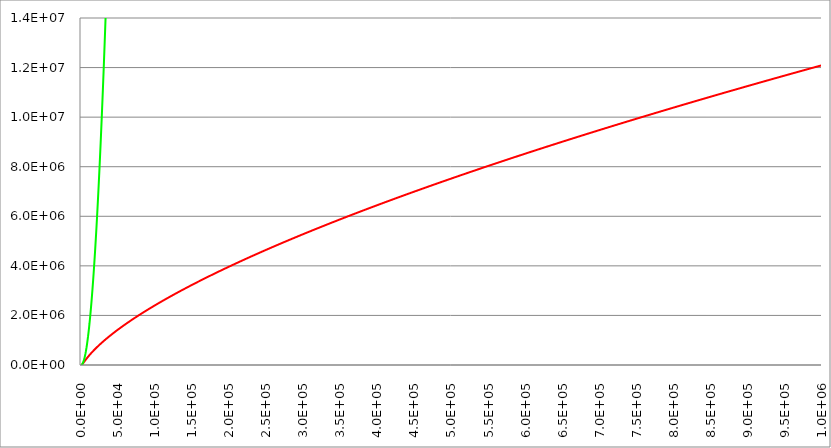
| Category | Series 1 | Series 0 | Series 2 |
|---|---|---|---|
| 0.0 | 0 | 0 |  |
| 500.0 | 3134.597 | 3185.921 |  |
| 1000.0 | 11984.812 | 12743.686 |  |
| 1500.0 | 25248.136 | 28673.293 |  |
| 2000.0 | 41521.552 | 50974.742 |  |
| 2500.0 | 59680.624 | 79648.035 |  |
| 3000.0 | 78943.64 | 114693.17 |  |
| 3500.0 | 98801.646 | 156110.148 |  |
| 4000.0 | 118932.125 | 203898.969 |  |
| 4500.0 | 139132.703 | 258059.633 |  |
| 5000.0 | 159276.982 | 318592.139 |  |
| 5500.0 | 179286.565 | 385496.488 |  |
| 6000.0 | 199113.59 | 458772.68 |  |
| 6500.0 | 218729.787 | 538420.715 |  |
| 7000.0 | 238119.567 | 624440.593 |  |
| 7500.0 | 257275.592 | 716832.313 |  |
| 8000.0 | 276195.912 | 815595.876 |  |
| 8500.0 | 294882.08 | 920731.282 |  |
| 9000.0 | 313337.9 | 1032238.531 |  |
| 9500.0 | 331568.594 | 1150117.622 |  |
| 10000.0 | 349580.239 | 1274368.556 |  |
| 10500.0 | 367379.385 | 1404991.333 |  |
| 11000.0 | 384972.8 | 1541985.953 |  |
| 11500.0 | 402367.29 | 1685352.416 |  |
| 12000.0 | 419569.593 | 1835090.721 |  |
| 12500.0 | 436586.292 | 1991200.869 |  |
| 13000.0 | 453423.774 | 2153682.86 |  |
| 13500.0 | 470088.201 | 2322536.694 |  |
| 14000.0 | 486585.487 | 2497762.37 |  |
| 14500.0 | 502921.298 | 2679359.889 |  |
| 15000.0 | 519101.049 | 2867329.251 |  |
| 15500.0 | 535129.909 | 3061670.456 |  |
| 16000.0 | 551012.807 | 3262383.504 |  |
| 16500.0 | 566754.438 | 3469468.394 |  |
| 17000.0 | 582359.28 | 3682925.127 |  |
| 17500.0 | 597831.594 | 3902753.703 |  |
| 18000.0 | 613175.444 | 4128954.122 |  |
| 18500.0 | 628394.701 | 4361526.384 |  |
| 19000.0 | 643493.056 | 4600470.488 |  |
| 19500.0 | 658474.031 | 4845786.435 |  |
| 20000.0 | 673340.982 | 5097474.225 |  |
| 20500.0 | 688097.118 | 5355533.857 |  |
| 21000.0 | 702745.501 | 5619965.333 |  |
| 21500.0 | 717289.058 | 5890768.651 |  |
| 22000.0 | 731730.587 | 6167943.812 |  |
| 22500.0 | 746072.767 | 6451490.816 |  |
| 23000.0 | 760318.162 | 6741409.662 |  |
| 23500.0 | 774469.227 | 7037700.352 |  |
| 24000.0 | 788528.316 | 7340362.884 |  |
| 24500.0 | 802497.687 | 7649397.259 |  |
| 25000.0 | 816379.506 | 7964803.476 |  |
| 25500.0 | 830175.853 | 8286581.537 |  |
| 26000.0 | 843888.726 | 8614731.44 |  |
| 26500.0 | 857520.047 | 8949253.186 |  |
| 27000.0 | 871071.662 | 9290146.775 |  |
| 27500.0 | 884545.35 | 9637412.206 |  |
| 28000.0 | 897942.822 | 9991049.481 |  |
| 28500.0 | 911265.728 | 10351058.598 |  |
| 29000.0 | 924515.656 | 10717439.558 |  |
| 29500.0 | 937694.139 | 11090192.36 |  |
| 30000.0 | 950802.656 | 11469317.006 |  |
| 30500.0 | 963842.634 | 11854813.494 |  |
| 31000.0 | 976815.451 | 12246681.825 |  |
| 31500.0 | 989722.44 | 12644921.999 |  |
| 32000.0 | 1002564.886 | 13049534.016 |  |
| 32500.0 | 1015344.036 | 13460517.875 |  |
| 33000.0 | 1028061.092 | 13877873.577 |  |
| 33500.0 | 1040717.222 | 14301601.122 |  |
| 34000.0 | 1053313.552 | 14731700.51 |  |
| 34500.0 | 1065851.177 | 15168171.74 |  |
| 35000.0 | 1078331.155 | 15611014.814 |  |
| 35500.0 | 1090754.514 | 16060229.73 |  |
| 36000.0 | 1103122.248 | 16515816.488 |  |
| 36500.0 | 1115435.325 | 16977775.09 |  |
| 37000.0 | 1127694.682 | 17446105.535 |  |
| 37500.0 | 1139901.23 | 17920807.822 |  |
| 38000.0 | 1152055.851 | 18401881.952 |  |
| 38500.0 | 1164159.406 | 18889327.924 |  |
| 39000.0 | 1176212.728 | 19383145.74 |  |
| 39500.0 | 1188216.629 | 19883335.398 |  |
| 40000.0 | 1200171.898 | 20389896.899 |  |
| 40500.0 | 1212079.304 | 20902830.243 |  |
| 41000.0 | 1223939.591 | 21422135.43 |  |
| 41500.0 | 1235753.489 | 21947812.459 |  |
| 42000.0 | 1247521.703 | 22479861.332 |  |
| 42500.0 | 1259244.925 | 23018282.047 |  |
| 43000.0 | 1270923.825 | 23563074.604 |  |
| 43500.0 | 1282559.058 | 24114239.005 |  |
| 44000.0 | 1294151.262 | 24671775.248 |  |
| 44500.0 | 1305701.058 | 25235683.334 |  |
| 45000.0 | 1317209.054 | 25805963.263 |  |
| 45500.0 | 1328675.841 | 26382615.035 |  |
| 46000.0 | 1340101.997 | 26965638.649 |  |
| 46500.0 | 1351488.084 | 27555034.107 |  |
| 47000.0 | 1362834.654 | 28150801.407 |  |
| 47500.0 | 1374142.243 | 28752940.549 |  |
| 48000.0 | 1385411.375 | 29361451.535 |  |
| 48500.0 | 1396642.565 | 29976334.363 |  |
| 49000.0 | 1407836.311 | 30597589.035 |  |
| 49500.0 | 1418993.103 | 31225215.549 |  |
| 50000.0 | 1430113.421 | 31859213.905 |  |
| 50500.0 | 1441197.732 | 32499584.105 |  |
| 51000.0 | 1452246.493 | 33146326.147 |  |
| 51500.0 | 1463260.152 | 33799440.032 |  |
| 52000.0 | 1474239.146 | 34458925.76 |  |
| 52500.0 | 1485183.905 | 35124783.331 |  |
| 53000.0 | 1496094.847 | 35797012.744 |  |
| 53500.0 | 1506972.383 | 36475614 |  |
| 54000.0 | 1517816.915 | 37160587.099 |  |
| 54500.0 | 1528628.836 | 37851932.041 |  |
| 55000.0 | 1539408.532 | 38549648.825 |  |
| 55500.0 | 1550156.381 | 39253737.453 |  |
| 56000.0 | 1560872.752 | 39964197.923 |  |
| 56500.0 | 1571558.008 | 40681030.236 |  |
| 57000.0 | 1582212.506 | 41404234.391 |  |
| 57500.0 | 1592836.592 | 42133810.39 |  |
| 58000.0 | 1603430.609 | 42869758.231 |  |
| 58500.0 | 1613994.892 | 43612077.915 |  |
| 59000.0 | 1624529.769 | 44360769.442 |  |
| 59500.0 | 1635035.563 | 45115832.811 |  |
| 60000.0 | 1645512.59 | 45877268.024 |  |
| 60500.0 | 1655961.16 | 46645075.079 |  |
| 61000.0 | 1666381.578 | 47419253.977 |  |
| 61500.0 | 1676774.142 | 48199804.717 |  |
| 62000.0 | 1687139.147 | 48986727.301 |  |
| 62500.0 | 1697476.879 | 49780021.727 |  |
| 63000.0 | 1707787.623 | 50579687.996 |  |
| 63500.0 | 1718071.655 | 51385726.108 |  |
| 64000.0 | 1728329.25 | 52198136.062 |  |
| 64500.0 | 1738560.674 | 53016917.86 |  |
| 65000.0 | 1748766.191 | 53842071.5 |  |
| 65500.0 | 1758946.06 | 54673596.983 |  |
| 66000.0 | 1769100.535 | 55511494.309 |  |
| 66500.0 | 1779229.867 | 56355763.477 |  |
| 67000.0 | 1789334.301 | 57206404.488 |  |
| 67500.0 | 1799414.078 | 58063417.342 |  |
| 68000.0 | 1809469.436 | 58926802.039 |  |
| 68500.0 | 1819500.609 | 59796558.579 |  |
| 69000.0 | 1829507.826 | 60672686.961 |  |
| 69500.0 | 1839491.314 | 61555187.186 |  |
| 70000.0 | 1849451.294 | 62444059.254 |  |
| 70500.0 | 1859387.985 | 63339303.165 |  |
| 71000.0 | 1869301.602 | 64240918.919 |  |
| 71500.0 | 1879192.357 | 65148906.515 |  |
| 72000.0 | 1889060.459 | 66063265.954 |  |
| 72500.0 | 1898906.112 | 66983997.236 |  |
| 73000.0 | 1908729.518 | 67911100.36 |  |
| 73500.0 | 1918530.875 | 68844575.328 |  |
| 74000.0 | 1928310.381 | 69784422.138 |  |
| 74500.0 | 1938068.226 | 70730640.791 |  |
| 75000.0 | 1947804.601 | 71683231.287 |  |
| 75500.0 | 1957519.693 | 72642193.625 |  |
| 76000.0 | 1967213.685 | 73607527.807 |  |
| 76500.0 | 1976886.758 | 74579233.831 |  |
| 77000.0 | 1986539.093 | 75557311.698 |  |
| 77500.0 | 1996170.863 | 76541761.407 |  |
| 78000.0 | 2005782.243 | 77532582.96 |  |
| 78500.0 | 2015373.403 | 78529776.355 |  |
| 79000.0 | 2024944.511 | 79533341.593 |  |
| 79500.0 | 2034495.734 | 80543278.674 |  |
| 80000.0 | 2044027.235 | 81559587.597 |  |
| 80500.0 | 2053539.175 | 82582268.364 |  |
| 81000.0 | 2063031.713 | 83611320.973 |  |
| 81500.0 | 2072505.006 | 84646745.425 |  |
| 82000.0 | 2081959.208 | 85688541.72 |  |
| 82500.0 | 2091394.471 | 86736709.857 |  |
| 83000.0 | 2100810.946 | 87791249.837 |  |
| 83500.0 | 2110208.781 | 88852161.66 |  |
| 84000.0 | 2119588.122 | 89919445.326 |  |
| 84500.0 | 2128949.112 | 90993100.835 |  |
| 85000.0 | 2138291.895 | 92073128.186 |  |
| 85500.0 | 2147616.611 | 93159527.38 |  |
| 86000.0 | 2156923.397 | 94252298.417 |  |
| 86500.0 | 2166212.39 | 95351441.297 |  |
| 87000.0 | 2175483.726 | 96456956.02 |  |
| 87500.0 | 2184737.537 | 97568842.585 |  |
| 88000.0 | 2193973.954 | 98687100.993 |  |
| 88500.0 | 2203193.107 | 99811731.244 |  |
| 89000.0 | 2212395.124 | 100942733.337 |  |
| 89500.0 | 2221580.131 | 102080107.274 |  |
| 90000.0 | 2230748.253 | 103223853.053 |  |
| 90500.0 | 2239899.612 | 104373970.675 |  |
| 91000.0 | 2249034.331 | 105530460.14 |  |
| 91500.0 | 2258152.529 | 106693321.447 |  |
| 92000.0 | 2267254.324 | 107862554.598 |  |
| 92500.0 | 2276339.833 | 109038159.591 |  |
| 93000.0 | 2285409.173 | 110220136.427 |  |
| 93500.0 | 2294462.457 | 111408485.105 |  |
| 94000.0 | 2303499.798 | 112603205.627 |  |
| 94500.0 | 2312521.306 | 113804297.991 |  |
| 95000.0 | 2321527.093 | 115011762.198 |  |
| 95500.0 | 2330517.267 | 116225598.248 |  |
| 96000.0 | 2339491.935 | 117445806.14 |  |
| 96500.0 | 2348451.203 | 118672385.876 |  |
| 97000.0 | 2357395.176 | 119905337.454 |  |
| 97500.0 | 2366323.958 | 121144660.875 |  |
| 98000.0 | 2375237.65 | 122390356.138 |  |
| 98500.0 | 2384136.355 | 123642423.245 |  |
| 99000.0 | 2393020.172 | 124900862.194 |  |
| 99500.0 | 2401889.2 | 126165672.986 |  |
| 100000.0 | 2410743.536 | 127436855.621 |  |
| 100500.0 | 2419583.278 | 128714410.099 |  |
| 101000.0 | 2428408.52 | 129998336.419 |  |
| 101500.0 | 2437219.357 | 131288634.582 |  |
| 102000.0 | 2446015.882 | 132585304.588 |  |
| 102500.0 | 2454798.188 | 133888346.437 |  |
| 103000.0 | 2463566.365 | 135197760.128 |  |
| 103500.0 | 2472320.505 | 136513545.663 |  |
| 104000.0 | 2481060.695 | 137835703.04 |  |
| 104500.0 | 2489787.025 | 139164232.26 |  |
| 105000.0 | 2498499.582 | 140499133.322 |  |
| 105500.0 | 2507198.451 | 141840406.228 |  |
| 106000.0 | 2515883.719 | 143188050.976 |  |
| 106500.0 | 2524555.47 | 144542067.567 |  |
| 107000.0 | 2533213.786 | 145902456 |  |
| 107500.0 | 2541858.752 | 147269216.277 |  |
| 108000.0 | 2550490.448 | 148642348.396 |  |
| 108500.0 | 2559108.956 | 150021852.358 |  |
| 109000.0 | 2567714.355 | 151407728.163 |  |
| 109500.0 | 2576306.725 | 152799975.811 |  |
| 110000.0 | 2584886.144 | 154198595.301 |  |
| 110500.0 | 2593452.689 | 155603586.635 |  |
| 111000.0 | 2602006.438 | 157014949.811 |  |
| 111500.0 | 2610547.465 | 158432684.829 |  |
| 112000.0 | 2619075.847 | 159856791.691 |  |
| 112500.0 | 2627591.658 | 161287270.395 |  |
| 113000.0 | 2636094.971 | 162724120.942 |  |
| 113500.0 | 2644585.859 | 164167343.332 |  |
| 114000.0 | 2653064.394 | 165616937.565 |  |
| 114500.0 | 2661530.648 | 167072903.641 |  |
| 115000.0 | 2669984.691 | 168535241.559 |  |
| 115500.0 | 2678426.593 | 170003951.32 |  |
| 116000.0 | 2686856.424 | 171479032.924 |  |
| 116500.0 | 2695274.252 | 172960486.37 |  |
| 117000.0 | 2703680.145 | 174448311.66 |  |
| 117500.0 | 2712074.17 | 175942508.792 |  |
| 118000.0 | 2720456.394 | 177443077.767 |  |
| 118500.0 | 2728826.882 | 178950018.584 |  |
| 119000.0 | 2737185.701 | 180463331.245 |  |
| 119500.0 | 2745532.914 | 181983015.748 |  |
| 120000.0 | 2753868.586 | 183509072.094 |  |
| 120500.0 | 2762192.78 | 185041500.283 |  |
| 121000.0 | 2770505.559 | 186580300.315 |  |
| 121500.0 | 2778806.985 | 188125472.189 |  |
| 122000.0 | 2787097.12 | 189677015.906 |  |
| 122500.0 | 2795376.025 | 191234931.466 |  |
| 123000.0 | 2803643.76 | 192799218.869 |  |
| 123500.0 | 2811900.385 | 194369878.115 |  |
| 124000.0 | 2820145.96 | 195946909.203 |  |
| 124500.0 | 2828380.543 | 197530312.134 |  |
| 125000.0 | 2836604.192 | 199120086.908 |  |
| 125500.0 | 2844816.966 | 200716233.524 |  |
| 126000.0 | 2853018.921 | 202318751.984 |  |
| 126500.0 | 2861210.114 | 203927642.286 |  |
| 127000.0 | 2869390.602 | 205542904.431 |  |
| 127500.0 | 2877560.439 | 207164538.419 |  |
| 128000.0 | 2885719.681 | 208792544.249 |  |
| 128500.0 | 2893868.383 | 210426921.923 |  |
| 129000.0 | 2902006.599 | 212067671.439 |  |
| 129500.0 | 2910134.382 | 213714792.798 |  |
| 130000.0 | 2918251.785 | 215368286 |  |
| 130500.0 | 2926358.862 | 217028151.044 |  |
| 131000.0 | 2934455.664 | 218694387.931 |  |
| 131500.0 | 2942542.244 | 220366996.661 |  |
| 132000.0 | 2950618.652 | 222045977.234 |  |
| 132500.0 | 2958684.94 | 223731329.65 |  |
| 133000.0 | 2966741.158 | 225423053.908 |  |
| 133500.0 | 2974787.355 | 227121150.009 |  |
| 134000.0 | 2982823.583 | 228825617.953 |  |
| 134500.0 | 2990849.888 | 230536457.74 |  |
| 135000.0 | 2998866.321 | 232253669.369 |  |
| 135500.0 | 3006872.93 | 233977252.842 |  |
| 136000.0 | 3014869.763 | 235707208.157 |  |
| 136500.0 | 3022856.866 | 237443535.314 |  |
| 137000.0 | 3030834.287 | 239186234.315 |  |
| 137500.0 | 3038802.074 | 240935305.158 |  |
| 138000.0 | 3046760.271 | 242690747.845 |  |
| 138500.0 | 3054708.925 | 244452562.374 |  |
| 139000.0 | 3062648.082 | 246220748.745 |  |
| 139500.0 | 3070577.787 | 247995306.96 |  |
| 140000.0 | 3078498.084 | 249776237.017 |  |
| 140500.0 | 3086409.018 | 251563538.917 |  |
| 141000.0 | 3094310.632 | 253357212.66 |  |
| 141500.0 | 3102202.971 | 255157258.246 |  |
| 142000.0 | 3110086.078 | 256963675.674 |  |
| 142500.0 | 3117959.996 | 258776464.945 |  |
| 143000.0 | 3125824.767 | 260595626.059 |  |
| 143500.0 | 3133680.434 | 262421159.016 |  |
| 144000.0 | 3141527.039 | 264253063.816 |  |
| 144500.0 | 3149364.623 | 266091340.458 |  |
| 145000.0 | 3157193.227 | 267935988.943 |  |
| 145500.0 | 3165012.893 | 269787009.271 |  |
| 146000.0 | 3172823.661 | 271644401.442 |  |
| 146500.0 | 3180625.572 | 273508165.455 |  |
| 147000.0 | 3188418.664 | 275378301.311 |  |
| 147500.0 | 3196202.979 | 277254809.01 |  |
| 148000.0 | 3203978.555 | 279137688.552 |  |
| 148500.0 | 3211745.431 | 281026939.937 |  |
| 149000.0 | 3219503.647 | 282922563.164 |  |
| 149500.0 | 3227253.24 | 284824558.234 |  |
| 150000.0 | 3234994.248 | 286732925.147 |  |
| 150500.0 | 3242726.711 | 288647663.903 |  |
| 151000.0 | 3250450.664 | 290568774.501 |  |
| 151500.0 | 3258166.146 | 292496256.943 |  |
| 152000.0 | 3265873.193 | 294430111.227 |  |
| 152500.0 | 3273571.842 | 296370337.354 |  |
| 153000.0 | 3281262.129 | 298316935.323 |  |
| 153500.0 | 3288944.092 | 300269905.136 |  |
| 154000.0 | 3296617.764 | 302229246.791 |  |
| 154500.0 | 3304283.183 | 304194960.289 |  |
| 155000.0 | 3311940.383 | 306167045.629 |  |
| 155500.0 | 3319589.4 | 308145502.813 |  |
| 156000.0 | 3327230.268 | 310130331.839 |  |
| 156500.0 | 3334863.022 | 312121532.708 |  |
| 157000.0 | 3342487.696 | 314119105.42 |  |
| 157500.0 | 3350104.324 | 316123049.975 |  |
| 158000.0 | 3357712.941 | 318133366.372 |  |
| 158500.0 | 3365313.578 | 320150054.612 |  |
| 159000.0 | 3372906.271 | 322173114.695 |  |
| 159500.0 | 3380491.052 | 324202546.621 |  |
| 160000.0 | 3388067.954 | 326238350.39 |  |
| 160500.0 | 3395637.009 | 328280526.001 |  |
| 161000.0 | 3403198.25 | 330329073.455 |  |
| 161500.0 | 3410751.708 | 332383992.752 |  |
| 162000.0 | 3418297.417 | 334445283.892 |  |
| 162500.0 | 3425835.406 | 336512946.874 |  |
| 163000.0 | 3433365.709 | 338586981.699 |  |
| 163500.0 | 3440888.355 | 340667388.367 |  |
| 164000.0 | 3448403.377 | 342754166.878 |  |
| 164500.0 | 3455910.805 | 344847317.232 |  |
| 165000.0 | 3463410.669 | 346946839.428 |  |
| 165500.0 | 3470902.999 | 349052733.467 |  |
| 166000.0 | 3478387.827 | 351164999.349 |  |
| 166500.0 | 3485865.181 | 353283637.074 |  |
| 167000.0 | 3493335.092 | 355408646.641 |  |
| 167500.0 | 3500797.589 | 357540028.052 |  |
| 168000.0 | 3508252.701 | 359677781.305 |  |
| 168500.0 | 3515700.457 | 361821906.401 |  |
| 169000.0 | 3523140.887 | 363972403.339 |  |
| 169500.0 | 3530574.019 | 366129272.121 |  |
| 170000.0 | 3537999.882 | 368292512.745 |  |
| 170500.0 | 3545418.503 | 370462125.212 |  |
| 171000.0 | 3552829.911 | 372638109.521 |  |
| 171500.0 | 3560234.134 | 374820465.674 |  |
| 172000.0 | 3567631.2 | 377009193.669 |  |
| 172500.0 | 3575021.136 | 379204293.507 |  |
| 173000.0 | 3582403.969 | 381405765.188 |  |
| 173500.0 | 3589779.728 | 383613608.712 |  |
| 174000.0 | 3597148.438 | 385827824.078 |  |
| 174500.0 | 3604510.126 | 388048411.287 |  |
| 175000.0 | 3611864.82 | 390275370.339 |  |
| 175500.0 | 3619212.546 | 392508701.234 |  |
| 176000.0 | 3626553.33 | 394748403.972 |  |
| 176500.0 | 3633887.197 | 396994478.552 |  |
| 177000.0 | 3641214.175 | 399246924.975 |  |
| 177500.0 | 3648534.289 | 401505743.241 |  |
| 178000.0 | 3655847.564 | 403770933.35 |  |
| 178500.0 | 3663154.026 | 406042495.301 |  |
| 179000.0 | 3670453.701 | 408320429.095 |  |
| 179500.0 | 3677746.613 | 410604734.732 |  |
| 180000.0 | 3685032.787 | 412895412.212 |  |
| 180500.0 | 3692312.248 | 415192461.535 |  |
| 181000.0 | 3699585.021 | 417495882.7 |  |
| 181500.0 | 3706851.13 | 419805675.708 |  |
| 182000.0 | 3714110.599 | 422121840.559 |  |
| 182500.0 | 3721363.454 | 424444377.253 |  |
| 183000.0 | 3728609.717 | 426773285.789 |  |
| 183500.0 | 3735849.413 | 429108566.168 |  |
| 184000.0 | 3743082.565 | 431450218.39 |  |
| 184500.0 | 3750309.197 | 433798242.455 |  |
| 185000.0 | 3757529.332 | 436152638.363 |  |
| 185500.0 | 3764742.994 | 438513406.113 |  |
| 186000.0 | 3771950.205 | 440880545.706 |  |
| 186500.0 | 3779150.99 | 443254057.142 |  |
| 187000.0 | 3786345.369 | 445633940.421 |  |
| 187500.0 | 3793533.367 | 448020195.543 |  |
| 188000.0 | 3800715.006 | 450412822.507 |  |
| 188500.0 | 3807890.308 | 452811821.314 |  |
| 189000.0 | 3815059.295 | 455217191.964 |  |
| 189500.0 | 3822221.99 | 457628934.456 |  |
| 190000.0 | 3829378.414 | 460047048.792 |  |
| 190500.0 | 3836528.59 | 462471534.97 |  |
| 191000.0 | 3843672.54 | 464902392.991 |  |
| 191500.0 | 3850810.284 | 467339622.855 |  |
| 192000.0 | 3857941.844 | 469783224.561 |  |
| 192500.0 | 3865067.242 | 472233198.111 |  |
| 193000.0 | 3872186.499 | 474689543.503 |  |
| 193500.0 | 3879299.636 | 477152260.738 |  |
| 194000.0 | 3886406.674 | 479621349.815 |  |
| 194500.0 | 3893507.633 | 482096810.736 |  |
| 195000.0 | 3900602.535 | 484578643.499 |  |
| 195500.0 | 3907691.401 | 487066848.105 |  |
| 196000.0 | 3914774.249 | 489561424.554 |  |
| 196500.0 | 3921851.102 | 492062372.845 |  |
| 197000.0 | 3928921.979 | 494569692.98 |  |
| 197500.0 | 3935986.9 | 497083384.957 |  |
| 198000.0 | 3943045.885 | 499603448.777 |  |
| 198500.0 | 3950098.954 | 502129884.439 |  |
| 199000.0 | 3957146.128 | 504662691.945 |  |
| 199500.0 | 3964187.424 | 507201871.293 |  |
| 200000.0 | 3971222.864 | 509747422.484 |  |
| 200500.0 | 3978252.467 | 512299345.518 |  |
| 201000.0 | 3985276.251 | 514857640.394 |  |
| 201500.0 | 3992294.236 | 517422307.114 |  |
| 202000.0 | 3999306.441 | 519993345.676 |  |
| 202500.0 | 4006312.885 | 522570756.081 |  |
| 203000.0 | 4013313.587 | 525154538.329 |  |
| 203500.0 | 4020308.565 | 527744692.419 |  |
| 204000.0 | 4027297.839 | 530341218.352 |  |
| 204500.0 | 4034281.427 | 532944116.128 |  |
| 205000.0 | 4041259.347 | 535553385.747 |  |
| 205500.0 | 4048231.618 | 538169027.209 |  |
| 206000.0 | 4055198.257 | 540791040.513 |  |
| 206500.0 | 4062159.284 | 543419425.66 |  |
| 207000.0 | 4069114.715 | 546054182.65 |  |
| 207500.0 | 4076064.57 | 548695311.483 |  |
| 208000.0 | 4083008.865 | 551342812.159 |  |
| 208500.0 | 4089947.619 | 553996684.677 |  |
| 209000.0 | 4096880.848 | 556656929.038 |  |
| 209500.0 | 4103808.572 | 559323545.242 |  |
| 210000.0 | 4110730.806 | 561996533.289 |  |
| 210500.0 | 4117647.569 | 564675893.178 |  |
| 211000.0 | 4124558.878 | 567361624.91 |  |
| 211500.0 | 4131464.749 | 570053728.485 |  |
| 212000.0 | 4138365.2 | 572752203.903 |  |
| 212500.0 | 4145260.248 | 575457051.164 |  |
| 213000.0 | 4152149.909 | 578168270.267 |  |
| 213500.0 | 4159034.202 | 580885861.213 |  |
| 214000.0 | 4165913.141 | 583609824.002 |  |
| 214500.0 | 4172786.744 | 586340158.634 |  |
| 215000.0 | 4179655.027 | 589076865.108 |  |
| 215500.0 | 4186518.007 | 591819943.425 |  |
| 216000.0 | 4193375.699 | 594569393.585 |  |
| 216500.0 | 4200228.121 | 597325215.588 |  |
| 217000.0 | 4207075.289 | 600087409.434 |  |
| 217500.0 | 4213917.217 | 602855975.122 |  |
| 218000.0 | 4220753.923 | 605630912.653 |  |
| 218500.0 | 4227585.423 | 608412222.027 |  |
| 219000.0 | 4234411.731 | 611199903.244 |  |
| 219500.0 | 4241232.865 | 613993956.303 |  |
| 220000.0 | 4248048.839 | 616794381.206 |  |
| 220500.0 | 4254859.668 | 619601177.951 |  |
| 221000.0 | 4261665.37 | 622414346.539 |  |
| 221500.0 | 4268465.958 | 625233886.969 |  |
| 222000.0 | 4275261.449 | 628059799.243 |  |
| 222500.0 | 4282051.857 | 630892083.359 |  |
| 223000.0 | 4288837.197 | 633730739.318 |  |
| 223500.0 | 4295617.485 | 636575767.119 |  |
| 224000.0 | 4302392.736 | 639427166.764 |  |
| 224500.0 | 4309162.965 | 642284938.251 |  |
| 225000.0 | 4315928.186 | 645149081.581 |  |
| 225500.0 | 4322688.414 | 648019596.754 |  |
| 226000.0 | 4329443.664 | 650896483.77 |  |
| 226500.0 | 4336193.951 | 653779742.628 |  |
| 227000.0 | 4342939.289 | 656669373.329 |  |
| 227500.0 | 4349679.692 | 659565375.873 |  |
| 228000.0 | 4356415.176 | 662467750.26 |  |
| 228500.0 | 4363145.753 | 665376496.49 |  |
| 229000.0 | 4369871.439 | 668291614.562 |  |
| 229500.0 | 4376592.248 | 671213104.477 |  |
| 230000.0 | 4383308.194 | 674140966.235 |  |
| 230500.0 | 4390019.29 | 677075199.836 |  |
| 231000.0 | 4396725.551 | 680015805.279 |  |
| 231500.0 | 4403426.991 | 682962782.565 |  |
| 232000.0 | 4410123.624 | 685916131.695 |  |
| 232500.0 | 4416815.462 | 688875852.666 |  |
| 233000.0 | 4423502.521 | 691841945.481 |  |
| 233500.0 | 4430184.813 | 694814410.138 |  |
| 234000.0 | 4436862.352 | 697793246.638 |  |
| 234500.0 | 4443535.152 | 700778454.981 |  |
| 235000.0 | 4450203.226 | 703770035.167 |  |
| 235500.0 | 4456866.587 | 706767987.195 |  |
| 236000.0 | 4463525.249 | 709772311.067 |  |
| 236500.0 | 4470179.224 | 712783006.781 |  |
| 237000.0 | 4476828.527 | 715800074.338 |  |
| 237500.0 | 4483473.17 | 718823513.737 |  |
| 238000.0 | 4490113.166 | 721853324.98 |  |
| 238500.0 | 4496748.528 | 724889508.065 |  |
| 239000.0 | 4503379.269 | 727932062.993 |  |
| 239500.0 | 4510005.401 | 730980989.763 |  |
| 240000.0 | 4516626.939 | 734036288.377 |  |
| 240500.0 | 4523243.893 | 737097958.833 |  |
| 241000.0 | 4529856.278 | 740166001.132 |  |
| 241500.0 | 4536464.105 | 743240415.274 |  |
| 242000.0 | 4543067.387 | 746321201.259 |  |
| 242500.0 | 4549666.137 | 749408359.086 |  |
| 243000.0 | 4556260.367 | 752501888.756 |  |
| 243500.0 | 4562850.089 | 755601790.269 |  |
| 244000.0 | 4569435.315 | 758708063.625 |  |
| 244500.0 | 4576016.058 | 761820708.824 |  |
| 245000.0 | 4582592.331 | 764939725.865 |  |
| 245500.0 | 4589164.144 | 768065114.749 |  |
| 246000.0 | 4595731.51 | 771196875.476 |  |
| 246500.0 | 4602294.442 | 774335008.046 |  |
| 247000.0 | 4608852.951 | 777479512.458 |  |
| 247500.0 | 4615407.049 | 780630388.713 |  |
| 248000.0 | 4621956.747 | 783787636.811 |  |
| 248500.0 | 4628502.059 | 786951256.752 |  |
| 249000.0 | 4635042.994 | 790121248.536 |  |
| 249500.0 | 4641579.566 | 793297612.162 |  |
| 250000.0 | 4648111.785 | 796480347.631 |  |
| 250500.0 | 4654639.663 | 799669454.943 |  |
| 251000.0 | 4661163.212 | 802864934.098 |  |
| 251500.0 | 4667682.443 | 806066785.095 |  |
| 252000.0 | 4674197.368 | 809275007.936 |  |
| 252500.0 | 4680707.998 | 812489602.619 |  |
| 253000.0 | 4687214.343 | 815710569.145 |  |
| 253500.0 | 4693716.416 | 818937907.513 |  |
| 254000.0 | 4700214.228 | 822171617.724 |  |
| 254500.0 | 4706707.789 | 825411699.779 |  |
| 255000.0 | 4713197.112 | 828658153.676 |  |
| 255500.0 | 4719682.206 | 831910979.415 |  |
| 256000.0 | 4726163.083 | 835170176.998 |  |
| 256500.0 | 4732639.754 | 838435746.423 |  |
| 257000.0 | 4739112.229 | 841707687.691 |  |
| 257500.0 | 4745580.52 | 844986000.802 |  |
| 258000.0 | 4752044.637 | 848270685.756 |  |
| 258500.0 | 4758504.592 | 851561742.552 |  |
| 259000.0 | 4764960.394 | 854859171.191 |  |
| 259500.0 | 4771412.055 | 858162971.673 |  |
| 260000.0 | 4777859.584 | 861473143.998 |  |
| 260500.0 | 4784302.994 | 864789688.166 |  |
| 261000.0 | 4790742.293 | 868112604.176 |  |
| 261500.0 | 4797177.492 | 871441892.029 |  |
| 262000.0 | 4803608.603 | 874777551.725 |  |
| 262500.0 | 4810035.635 | 878119583.264 |  |
| 263000.0 | 4816458.599 | 881467986.645 |  |
| 263500.0 | 4822877.504 | 884822761.869 |  |
| 264000.0 | 4829292.362 | 888183908.936 |  |
| 264500.0 | 4835703.182 | 891551427.846 |  |
| 265000.0 | 4842109.974 | 894925318.599 |  |
| 265500.0 | 4848512.749 | 898305581.194 |  |
| 266000.0 | 4854911.517 | 901692215.632 |  |
| 266500.0 | 4861306.287 | 905085221.913 |  |
| 267000.0 | 4867697.07 | 908484600.037 |  |
| 267500.0 | 4874083.875 | 911890350.003 |  |
| 268000.0 | 4880466.713 | 915302471.812 |  |
| 268500.0 | 4886845.592 | 918720965.464 |  |
| 269000.0 | 4893220.524 | 922145830.959 |  |
| 269500.0 | 4899591.518 | 925577068.297 |  |
| 270000.0 | 4905958.582 | 929014677.477 |  |
| 270500.0 | 4912321.728 | 932458658.5 |  |
| 271000.0 | 4918680.965 | 935909011.366 |  |
| 271500.0 | 4925036.303 | 939365736.075 |  |
| 272000.0 | 4931387.749 | 942828832.626 |  |
| 272500.0 | 4937735.315 | 946298301.021 |  |
| 273000.0 | 4944079.01 | 949774141.258 |  |
| 273500.0 | 4950418.844 | 953256353.338 |  |
| 274000.0 | 4956754.825 | 956744937.26 |  |
| 274500.0 | 4963086.963 | 960239893.026 |  |
| 275000.0 | 4969415.267 | 963741220.634 |  |
| 275500.0 | 4975739.747 | 967248920.085 |  |
| 276000.0 | 4982060.411 | 970762991.379 |  |
| 276500.0 | 4988377.269 | 974283434.515 |  |
| 277000.0 | 4994690.33 | 977810249.494 |  |
| 277500.0 | 5000999.604 | 981343436.317 |  |
| 278000.0 | 5007305.099 | 984882994.981 |  |
| 278500.0 | 5013606.824 | 988428925.489 |  |
| 279000.0 | 5019904.788 | 991981227.839 |  |
| 279500.0 | 5026199 | 995539902.033 |  |
| 280000.0 | 5032489.47 | 999104948.069 |  |
| 280500.0 | 5038776.206 | 1002676365.947 |  |
| 281000.0 | 5045059.216 | 1006254155.669 |  |
| 281500.0 | 5051338.511 | 1009838317.233 |  |
| 282000.0 | 5057614.097 | 1013428850.64 |  |
| 282500.0 | 5063885.985 | 1017025755.89 |  |
| 283000.0 | 5070154.182 | 1020629032.983 |  |
| 283500.0 | 5076418.699 | 1024238681.919 |  |
| 284000.0 | 5082679.542 | 1027854702.697 |  |
| 284500.0 | 5088936.721 | 1031477095.318 |  |
| 285000.0 | 5095190.244 | 1035105859.782 |  |
| 285500.0 | 5101440.121 | 1038740996.088 |  |
| 286000.0 | 5107686.359 | 1042382504.238 |  |
| 286500.0 | 5113928.966 | 1046030384.23 |  |
| 287000.0 | 5120167.951 | 1049684636.065 |  |
| 287500.0 | 5126403.323 | 1053345259.742 |  |
| 288000.0 | 5132635.091 | 1057012255.263 |  |
| 288500.0 | 5138863.261 | 1060685622.626 |  |
| 289000.0 | 5145087.843 | 1064365361.832 |  |
| 289500.0 | 5151308.844 | 1068051472.881 |  |
| 290000.0 | 5157526.274 | 1071743955.773 |  |
| 290500.0 | 5163740.14 | 1075442810.507 |  |
| 291000.0 | 5169950.45 | 1079148037.084 |  |
| 291500.0 | 5176157.212 | 1082859635.504 |  |
| 292000.0 | 5182360.436 | 1086577605.767 |  |
| 292500.0 | 5188560.127 | 1090301947.872 |  |
| 293000.0 | 5194756.296 | 1094032661.821 |  |
| 293500.0 | 5200948.949 | 1097769747.612 |  |
| 294000.0 | 5207138.094 | 1101513205.246 |  |
| 294500.0 | 5213323.74 | 1105263034.722 |  |
| 295000.0 | 5219505.895 | 1109019236.042 |  |
| 295500.0 | 5225684.566 | 1112781809.204 |  |
| 296000.0 | 5231859.76 | 1116550754.209 |  |
| 296500.0 | 5238031.487 | 1120326071.057 |  |
| 297000.0 | 5244199.753 | 1124107759.747 |  |
| 297500.0 | 5250364.567 | 1127895820.281 |  |
| 298000.0 | 5256525.936 | 1131690252.657 |  |
| 298500.0 | 5262683.868 | 1135491056.876 |  |
| 299000.0 | 5268838.37 | 1139298232.937 |  |
| 299500.0 | 5274989.451 | 1143111780.842 |  |
| 300000.0 | 5281137.117 | 1146931700.589 |  |
| 300500.0 | 5287281.376 | 1150757992.179 |  |
| 301000.0 | 5293422.236 | 1154590655.612 |  |
| 301500.0 | 5299559.704 | 1158429690.887 |  |
| 302000.0 | 5305693.788 | 1162275098.006 |  |
| 302500.0 | 5311824.495 | 1166126876.967 |  |
| 303000.0 | 5317951.833 | 1169985027.771 |  |
| 303500.0 | 5324075.808 | 1173849550.418 |  |
| 304000.0 | 5330196.43 | 1177720444.907 |  |
| 304500.0 | 5336313.704 | 1181597711.239 |  |
| 305000.0 | 5342427.638 | 1185481349.414 |  |
| 305500.0 | 5348538.239 | 1189371359.432 |  |
| 306000.0 | 5354645.515 | 1193267741.293 |  |
| 306500.0 | 5360749.472 | 1197170494.996 |  |
| 307000.0 | 5366850.119 | 1201079620.542 |  |
| 307500.0 | 5372947.462 | 1204995117.931 |  |
| 308000.0 | 5379041.507 | 1208916987.163 |  |
| 308500.0 | 5385132.263 | 1212845228.238 |  |
| 309000.0 | 5391219.737 | 1216779841.155 |  |
| 309500.0 | 5397303.935 | 1220720825.915 |  |
| 310000.0 | 5403384.865 | 1224668182.518 |  |
| 310500.0 | 5409462.534 | 1228621910.964 |  |
| 311000.0 | 5415536.948 | 1232582011.252 |  |
| 311500.0 | 5421608.114 | 1236548483.383 |  |
| 312000.0 | 5427676.04 | 1240521327.357 |  |
| 312500.0 | 5433740.733 | 1244500543.174 |  |
| 313000.0 | 5439802.198 | 1248486130.833 |  |
| 313500.0 | 5445860.444 | 1252478090.336 |  |
| 314000.0 | 5451915.476 | 1256476421.681 |  |
| 314500.0 | 5457967.303 | 1260481124.869 |  |
| 315000.0 | 5464015.929 | 1264492199.899 |  |
| 315500.0 | 5470061.363 | 1268509646.773 |  |
| 316000.0 | 5476103.611 | 1272533465.489 |  |
| 316500.0 | 5482142.679 | 1276563656.048 |  |
| 317000.0 | 5488178.575 | 1280600218.45 |  |
| 317500.0 | 5494211.305 | 1284643152.695 |  |
| 318000.0 | 5500240.876 | 1288692458.782 |  |
| 318500.0 | 5506267.293 | 1292748136.712 |  |
| 319000.0 | 5512290.565 | 1296810186.485 |  |
| 319500.0 | 5518310.696 | 1300878608.101 |  |
| 320000.0 | 5524327.695 | 1304953401.559 |  |
| 320500.0 | 5530341.568 | 1309034566.86 |  |
| 321000.0 | 5536352.32 | 1313122104.004 |  |
| 321500.0 | 5542359.958 | 1317216012.991 |  |
| 322000.0 | 5548364.489 | 1321316293.821 |  |
| 322500.0 | 5554365.919 | 1325422946.493 |  |
| 323000.0 | 5560364.256 | 1329535971.008 |  |
| 323500.0 | 5566359.503 | 1333655367.366 |  |
| 324000.0 | 5572351.67 | 1337781135.567 |  |
| 324500.0 | 5578340.76 | 1341913275.611 |  |
| 325000.0 | 5584326.782 | 1346051787.497 |  |
| 325500.0 | 5590309.741 | 1350196671.226 |  |
| 326000.0 | 5596289.644 | 1354347926.798 |  |
| 326500.0 | 5602266.496 | 1358505554.212 |  |
| 327000.0 | 5608240.304 | 1362669553.47 |  |
| 327500.0 | 5614211.074 | 1366839924.57 |  |
| 328000.0 | 5620178.812 | 1371016667.513 |  |
| 328500.0 | 5626143.526 | 1375199782.299 |  |
| 329000.0 | 5632105.218 | 1379389268.927 |  |
| 329500.0 | 5638063.899 | 1383585127.399 |  |
| 330000.0 | 5644019.572 | 1387787357.713 |  |
| 330500.0 | 5649972.243 | 1391995959.87 |  |
| 331000.0 | 5655921.919 | 1396210933.869 |  |
| 331500.0 | 5661868.606 | 1400432279.712 |  |
| 332000.0 | 5667812.31 | 1404659997.397 |  |
| 332500.0 | 5673753.038 | 1408894086.925 |  |
| 333000.0 | 5679690.793 | 1413134548.296 |  |
| 333500.0 | 5685625.583 | 1417381381.509 |  |
| 334000.0 | 5691557.413 | 1421634586.566 |  |
| 334500.0 | 5697486.29 | 1425894163.465 |  |
| 335000.0 | 5703412.22 | 1430160112.207 |  |
| 335500.0 | 5709335.208 | 1434432432.791 |  |
| 336000.0 | 5715255.26 | 1438711125.219 |  |
| 336500.0 | 5721172.381 | 1442996189.489 |  |
| 337000.0 | 5727086.578 | 1447287625.602 |  |
| 337500.0 | 5732997.857 | 1451585433.558 |  |
| 338000.0 | 5738906.223 | 1455889613.357 |  |
| 338500.0 | 5744811.681 | 1460200164.998 |  |
| 339000.0 | 5750714.239 | 1464517088.482 |  |
| 339500.0 | 5756613.899 | 1468840383.809 |  |
| 340000.0 | 5762510.672 | 1473170050.979 |  |
| 340500.0 | 5768404.559 | 1477506089.991 |  |
| 341000.0 | 5774295.567 | 1481848500.847 |  |
| 341500.0 | 5780183.702 | 1486197283.545 |  |
| 342000.0 | 5786068.97 | 1490552438.086 |  |
| 342500.0 | 5791951.376 | 1494913964.469 |  |
| 343000.0 | 5797830.925 | 1499281862.696 |  |
| 343500.0 | 5803707.623 | 1503656132.765 |  |
| 344000.0 | 5809581.476 | 1508036774.677 |  |
| 344500.0 | 5815452.489 | 1512423788.431 |  |
| 345000.0 | 5821320.669 | 1516817174.029 |  |
| 345500.0 | 5827186.018 | 1521216931.469 |  |
| 346000.0 | 5833048.544 | 1525623060.752 |  |
| 346500.0 | 5838908.252 | 1530035561.878 |  |
| 347000.0 | 5844765.147 | 1534454434.847 |  |
| 347500.0 | 5850619.236 | 1538879679.658 |  |
| 348000.0 | 5856470.522 | 1543311296.313 |  |
| 348500.0 | 5862319.013 | 1547749284.81 |  |
| 349000.0 | 5868164.711 | 1552193645.149 |  |
| 349500.0 | 5874007.624 | 1556644377.332 |  |
| 350000.0 | 5879847.756 | 1561101481.357 |  |
| 350500.0 | 5885685.113 | 1565564957.225 |  |
| 351000.0 | 5891519.7 | 1570034804.936 |  |
| 351500.0 | 5897351.522 | 1574511024.49 |  |
| 352000.0 | 5903180.585 | 1578993615.887 |  |
| 352500.0 | 5909006.893 | 1583482579.126 |  |
| 353000.0 | 5914830.452 | 1587977914.208 |  |
| 353500.0 | 5920651.267 | 1592479621.133 |  |
| 354000.0 | 5926469.343 | 1596987699.9 |  |
| 354500.0 | 5932284.686 | 1601502150.511 |  |
| 355000.0 | 5938097.3 | 1606022972.964 |  |
| 355500.0 | 5943907.191 | 1610550167.26 |  |
| 356000.0 | 5949714.364 | 1615083733.398 |  |
| 356500.0 | 5955518.823 | 1619623671.38 |  |
| 357000.0 | 5961320.574 | 1624169981.204 |  |
| 357500.0 | 5967119.622 | 1628722662.871 |  |
| 358000.0 | 5972915.971 | 1633281716.381 |  |
| 358500.0 | 5978709.628 | 1637847141.734 |  |
| 359000.0 | 5984500.597 | 1642418938.929 |  |
| 359500.0 | 5990288.882 | 1646997107.967 |  |
| 360000.0 | 5996074.49 | 1651581648.848 |  |
| 360500.0 | 6001857.423 | 1656172561.572 |  |
| 361000.0 | 6007637.688 | 1660769846.139 |  |
| 361500.0 | 6013415.29 | 1665373502.548 |  |
| 362000.0 | 6019190.235 | 1669983530.8 |  |
| 362500.0 | 6024962.525 | 1674599930.895 |  |
| 363000.0 | 6030732.167 | 1679222702.832 |  |
| 363500.0 | 6036499.165 | 1683851846.613 |  |
| 364000.0 | 6042263.523 | 1688487362.236 |  |
| 364500.0 | 6048025.249 | 1693129249.702 |  |
| 365000.0 | 6053784.343 | 1697777509.011 |  |
| 365500.0 | 6059540.813 | 1702432140.162 |  |
| 366000.0 | 6065294.664 | 1707093143.157 |  |
| 366500.0 | 6071045.9 | 1711760517.994 |  |
| 367000.0 | 6076794.525 | 1716434264.674 |  |
| 367500.0 | 6082540.545 | 1721114383.196 |  |
| 368000.0 | 6088283.963 | 1725800873.562 |  |
| 368500.0 | 6094024.787 | 1730493735.77 |  |
| 369000.0 | 6099763.017 | 1735192969.821 |  |
| 369500.0 | 6105498.662 | 1739898575.715 |  |
| 370000.0 | 6111231.724 | 1744610553.452 |  |
| 370500.0 | 6116962.208 | 1749328903.031 |  |
| 371000.0 | 6122690.12 | 1754053624.453 |  |
| 371500.0 | 6128415.464 | 1758784717.718 |  |
| 372000.0 | 6134138.244 | 1763522182.826 |  |
| 372500.0 | 6139858.464 | 1768266019.776 |  |
| 373000.0 | 6145576.13 | 1773016228.57 |  |
| 373500.0 | 6151291.246 | 1777772809.206 |  |
| 374000.0 | 6157003.816 | 1782535761.684 |  |
| 374500.0 | 6162713.847 | 1787305086.006 |  |
| 375000.0 | 6168421.34 | 1792080782.17 |  |
| 375500.0 | 6174126.302 | 1796862850.178 |  |
| 376000.0 | 6179828.735 | 1801651290.028 |  |
| 376500.0 | 6185528.647 | 1806446101.72 |  |
| 377000.0 | 6191226.04 | 1811247285.256 |  |
| 377500.0 | 6196920.918 | 1816054840.634 |  |
| 378000.0 | 6202613.287 | 1820868767.855 |  |
| 378500.0 | 6208303.151 | 1825689066.919 |  |
| 379000.0 | 6213990.515 | 1830515737.826 |  |
| 379500.0 | 6219675.38 | 1835348780.575 |  |
| 380000.0 | 6225357.756 | 1840188195.167 |  |
| 380500.0 | 6231037.643 | 1845033981.602 |  |
| 381000.0 | 6236715.045 | 1849886139.88 |  |
| 381500.0 | 6242389.97 | 1854744670.001 |  |
| 382000.0 | 6248062.42 | 1859609571.964 |  |
| 382500.0 | 6253732.4 | 1864480845.77 |  |
| 383000.0 | 6259399.913 | 1869358491.419 |  |
| 383500.0 | 6265064.964 | 1874242508.911 |  |
| 384000.0 | 6270727.56 | 1879132898.245 |  |
| 384500.0 | 6276387.699 | 1884029659.422 |  |
| 385000.0 | 6282045.392 | 1888932792.442 |  |
| 385500.0 | 6287700.64 | 1893842297.305 |  |
| 386000.0 | 6293353.446 | 1898758174.011 |  |
| 386500.0 | 6299003.816 | 1903680422.559 |  |
| 387000.0 | 6304651.754 | 1908609042.95 |  |
| 387500.0 | 6310297.264 | 1913544035.184 |  |
| 388000.0 | 6315940.351 | 1918485399.261 |  |
| 388500.0 | 6321581.018 | 1923433135.18 |  |
| 389000.0 | 6327219.269 | 1928387242.943 |  |
| 389500.0 | 6332855.107 | 1933347722.548 |  |
| 390000.0 | 6338488.54 | 1938314573.996 |  |
| 390500.0 | 6344119.57 | 1943287797.286 |  |
| 391000.0 | 6349748.2 | 1948267392.42 |  |
| 391500.0 | 6355374.435 | 1953253359.396 |  |
| 392000.0 | 6360998.281 | 1958245698.215 |  |
| 392500.0 | 6366619.739 | 1963244408.876 |  |
| 393000.0 | 6372238.812 | 1968249491.381 |  |
| 393500.0 | 6377855.508 | 1973260945.728 |  |
| 394000.0 | 6383469.829 | 1978278771.918 |  |
| 394500.0 | 6389081.78 | 1983302969.951 |  |
| 395000.0 | 6394691.364 | 1988333539.827 |  |
| 395500.0 | 6400298.585 | 1993370481.545 |  |
| 396000.0 | 6405903.447 | 1998413795.106 |  |
| 396500.0 | 6411505.955 | 2003463480.51 |  |
| 397000.0 | 6417106.111 | 2008519537.757 |  |
| 397500.0 | 6422703.92 | 2013581966.847 |  |
| 398000.0 | 6428299.388 | 2018650767.779 |  |
| 398500.0 | 6433892.514 | 2023725940.554 |  |
| 399000.0 | 6439483.307 | 2028807485.172 |  |
| 399500.0 | 6445071.768 | 2033895401.633 |  |
| 400000.0 | 6450657.902 | 2038989689.936 |  |
| 400500.0 | 6456241.711 | 2044090350.082 |  |
| 401000.0 | 6461823.201 | 2049197382.071 |  |
| 401500.0 | 6467402.377 | 2054310785.903 |  |
| 402000.0 | 6472979.239 | 2059430561.578 |  |
| 402500.0 | 6478553.792 | 2064556709.095 |  |
| 403000.0 | 6484126.044 | 2069689228.455 |  |
| 403500.0 | 6489695.993 | 2074828119.658 |  |
| 404000.0 | 6495263.644 | 2079973382.704 |  |
| 404500.0 | 6500829.006 | 2085125017.592 |  |
| 405000.0 | 6506392.074 | 2090283024.324 |  |
| 405500.0 | 6511952.859 | 2095447402.898 |  |
| 406000.0 | 6517511.364 | 2100618153.314 |  |
| 406500.0 | 6523067.59 | 2105795275.574 |  |
| 407000.0 | 6528621.541 | 2110978769.676 |  |
| 407500.0 | 6534173.222 | 2116168635.622 |  |
| 408000.0 | 6539722.635 | 2121364873.41 |  |
| 408500.0 | 6545269.785 | 2126567483.04 |  |
| 409000.0 | 6550814.677 | 2131776464.514 |  |
| 409500.0 | 6556357.313 | 2136991817.83 |  |
| 410000.0 | 6561897.696 | 2142213542.989 |  |
| 410500.0 | 6567435.832 | 2147441639.991 |  |
| 411000.0 | 6572971.722 | 2152676108.836 |  |
| 411500.0 | 6578505.371 | 2157916949.523 |  |
| 412000.0 | 6584036.782 | 2163164162.053 |  |
| 412500.0 | 6589565.961 | 2168417746.426 |  |
| 413000.0 | 6595092.908 | 2173677702.642 |  |
| 413500.0 | 6600617.628 | 2178944030.701 |  |
| 414000.0 | 6606140.126 | 2184216730.602 |  |
| 414500.0 | 6611660.405 | 2189495802.346 |  |
| 415000.0 | 6617178.466 | 2194781245.933 |  |
| 415500.0 | 6622694.316 | 2200073061.362 |  |
| 416000.0 | 6628207.956 | 2205371248.635 |  |
| 416500.0 | 6633719.39 | 2210675807.75 |  |
| 417000.0 | 6639228.625 | 2215986738.708 |  |
| 417500.0 | 6644735.66 | 2221304041.509 |  |
| 418000.0 | 6650240.5 | 2226627716.152 |  |
| 418500.0 | 6655743.148 | 2231957762.639 |  |
| 419000.0 | 6661243.609 | 2237294180.968 |  |
| 419500.0 | 6666741.887 | 2242636971.14 |  |
| 420000.0 | 6672237.982 | 2247986133.155 |  |
| 420500.0 | 6677731.901 | 2253341667.012 |  |
| 421000.0 | 6683223.645 | 2258703572.712 |  |
| 421500.0 | 6688713.219 | 2264071850.255 |  |
| 422000.0 | 6694200.625 | 2269446499.641 |  |
| 422500.0 | 6699685.867 | 2274827520.87 |  |
| 423000.0 | 6705168.951 | 2280214913.941 |  |
| 423500.0 | 6710649.875 | 2285608678.855 |  |
| 424000.0 | 6716128.648 | 2291008815.612 |  |
| 424500.0 | 6721605.269 | 2296415324.212 |  |
| 425000.0 | 6727079.745 | 2301828204.654 |  |
| 425500.0 | 6732552.077 | 2307247456.94 |  |
| 426000.0 | 6738022.269 | 2312673081.068 |  |
| 426500.0 | 6743490.323 | 2318105077.039 |  |
| 427000.0 | 6748956.243 | 2323543444.852 |  |
| 427500.0 | 6754420.035 | 2328988184.509 |  |
| 428000.0 | 6759881.701 | 2334439296.008 |  |
| 428500.0 | 6765341.241 | 2339896779.35 |  |
| 429000.0 | 6770798.662 | 2345360634.535 |  |
| 429500.0 | 6776253.967 | 2350830861.562 |  |
| 430000.0 | 6781707.156 | 2356307460.432 |  |
| 430500.0 | 6787158.236 | 2361790431.146 |  |
| 431000.0 | 6792607.209 | 2367279773.701 |  |
| 431500.0 | 6798054.079 | 2372775488.1 |  |
| 432000.0 | 6803498.849 | 2378277574.341 |  |
| 432500.0 | 6808941.519 | 2383786032.426 |  |
| 433000.0 | 6814382.096 | 2389300862.353 |  |
| 433500.0 | 6819820.582 | 2394822064.122 |  |
| 434000.0 | 6825256.98 | 2400349637.735 |  |
| 434500.0 | 6830691.294 | 2405883583.19 |  |
| 435000.0 | 6836123.529 | 2411423900.489 |  |
| 435500.0 | 6841553.682 | 2416970589.629 |  |
| 436000.0 | 6846981.764 | 2422523650.613 |  |
| 436500.0 | 6852407.77 | 2428083083.44 |  |
| 437000.0 | 6857831.712 | 2433648888.109 |  |
| 437500.0 | 6863253.585 | 2439221064.621 |  |
| 438000.0 | 6868673.398 | 2444799612.976 |  |
| 438500.0 | 6874091.148 | 2450384533.173 |  |
| 439000.0 | 6879506.845 | 2455975825.214 |  |
| 439500.0 | 6884920.489 | 2461573489.097 |  |
| 440000.0 | 6890332.083 | 2467177524.823 |  |
| 440500.0 | 6895741.629 | 2472787932.391 |  |
| 441000.0 | 6901149.135 | 2478404711.803 |  |
| 441500.0 | 6906554.596 | 2484027863.057 |  |
| 442000.0 | 6911958.024 | 2489657386.154 |  |
| 442500.0 | 6917359.415 | 2495293281.094 |  |
| 443000.0 | 6922758.773 | 2500935547.877 |  |
| 443500.0 | 6928156.104 | 2506584186.502 |  |
| 444000.0 | 6933551.409 | 2512239196.97 |  |
| 444500.0 | 6938944.695 | 2517900579.281 |  |
| 445000.0 | 6944335.959 | 2523568333.435 |  |
| 445500.0 | 6949725.208 | 2529242459.432 |  |
| 446000.0 | 6955112.444 | 2534922957.271 |  |
| 446500.0 | 6960497.668 | 2540609826.953 |  |
| 447000.0 | 6965880.886 | 2546303068.478 |  |
| 447500.0 | 6971262.099 | 2552002681.845 |  |
| 448000.0 | 6976641.312 | 2557708667.056 |  |
| 448500.0 | 6982018.528 | 2563421024.109 |  |
| 449000.0 | 6987393.748 | 2569139753.005 |  |
| 449500.0 | 6992766.974 | 2574864853.744 |  |
| 450000.0 | 6998138.211 | 2580596326.325 |  |
| 450500.0 | 7003507.461 | 2586334170.75 |  |
| 451000.0 | 7008874.73 | 2592078387.017 |  |
| 451500.0 | 7014240.018 | 2597828975.127 |  |
| 452000.0 | 7019603.327 | 2603585935.079 |  |
| 452500.0 | 7024964.663 | 2609349266.875 |  |
| 453000.0 | 7030324.024 | 2615118970.513 |  |
| 453500.0 | 7035681.419 | 2620895045.994 |  |
| 454000.0 | 7041036.848 | 2626677493.318 |  |
| 454500.0 | 7046390.312 | 2632466312.485 |  |
| 455000.0 | 7051741.817 | 2638261503.494 |  |
| 455500.0 | 7057091.364 | 2644063066.346 |  |
| 456000.0 | 7062438.957 | 2649871001.041 |  |
| 456500.0 | 7067784.598 | 2655685307.579 |  |
| 457000.0 | 7073128.29 | 2661505985.959 |  |
| 457500.0 | 7078470.036 | 2667333036.182 |  |
| 458000.0 | 7083809.841 | 2673166458.248 |  |
| 458500.0 | 7089147.703 | 2679006252.157 |  |
| 459000.0 | 7094483.626 | 2684852417.909 |  |
| 459500.0 | 7099817.615 | 2690704955.503 |  |
| 460000.0 | 7105149.677 | 2696563864.941 |  |
| 460500.0 | 7110479.805 | 2702429146.22 |  |
| 461000.0 | 7115808.009 | 2708300799.343 |  |
| 461500.0 | 7121134.286 | 2714178824.309 |  |
| 462000.0 | 7126458.644 | 2720063221.117 |  |
| 462500.0 | 7131781.086 | 2725953989.768 |  |
| 463000.0 | 7137101.611 | 2731851130.262 |  |
| 463500.0 | 7142420.224 | 2737754642.599 |  |
| 464000.0 | 7147736.927 | 2743664526.778 |  |
| 464500.0 | 7153051.723 | 2749580782.8 |  |
| 465000.0 | 7158364.614 | 2755503410.665 |  |
| 465500.0 | 7163675.605 | 2761432410.373 |  |
| 466000.0 | 7168984.697 | 2767367781.924 |  |
| 466500.0 | 7174291.89 | 2773309525.317 |  |
| 467000.0 | 7179597.194 | 2779257640.553 |  |
| 467500.0 | 7184900.604 | 2785212127.632 |  |
| 468000.0 | 7190202.127 | 2791172986.554 |  |
| 468500.0 | 7195501.766 | 2797140217.318 |  |
| 469000.0 | 7200799.519 | 2803113819.925 |  |
| 469500.0 | 7206095.394 | 2809093794.375 |  |
| 470000.0 | 7211389.392 | 2815080140.668 |  |
| 470500.0 | 7216681.515 | 2821072858.804 |  |
| 471000.0 | 7221971.767 | 2827071948.782 |  |
| 471500.0 | 7227260.149 | 2833077410.603 |  |
| 472000.0 | 7232546.662 | 2839089244.267 |  |
| 472500.0 | 7237831.313 | 2845107449.774 |  |
| 473000.0 | 7243114.101 | 2851132027.123 |  |
| 473500.0 | 7248395.034 | 2857162976.315 |  |
| 474000.0 | 7253674.107 | 2863200297.351 |  |
| 474500.0 | 7258951.327 | 2869243990.228 |  |
| 475000.0 | 7264226.697 | 2875294054.949 |  |
| 475500.0 | 7269500.217 | 2881350491.512 |  |
| 476000.0 | 7274771.893 | 2887413299.919 |  |
| 476500.0 | 7280041.724 | 2893482480.167 |  |
| 477000.0 | 7285309.715 | 2899558032.259 |  |
| 477500.0 | 7290575.866 | 2905639956.194 |  |
| 478000.0 | 7295840.186 | 2911728251.971 |  |
| 478500.0 | 7301102.668 | 2917822919.591 |  |
| 479000.0 | 7306363.322 | 2923923959.054 |  |
| 479500.0 | 7311622.15 | 2930031370.36 |  |
| 480000.0 | 7316879.148 | 2936145153.508 |  |
| 480500.0 | 7322134.325 | 2942265308.499 |  |
| 481000.0 | 7327387.685 | 2948391835.333 |  |
| 481500.0 | 7332639.221 | 2954524734.01 |  |
| 482000.0 | 7337888.947 | 2960664004.529 |  |
| 482500.0 | 7343136.858 | 2966809646.892 |  |
| 483000.0 | 7348382.96 | 2972961661.097 |  |
| 483500.0 | 7353627.25 | 2979120047.145 |  |
| 484000.0 | 7358869.741 | 2985284805.035 |  |
| 484500.0 | 7364110.425 | 2991455934.769 |  |
| 485000.0 | 7369349.311 | 2997633436.345 |  |
| 485500.0 | 7374586.397 | 3003817309.764 |  |
| 486000.0 | 7379821.687 | 3010007555.026 |  |
| 486500.0 | 7385055.185 | 3016204172.131 |  |
| 487000.0 | 7390286.893 | 3022407161.078 |  |
| 487500.0 | 7395516.812 | 3028616521.868 |  |
| 488000.0 | 7400744.947 | 3034832254.501 |  |
| 488500.0 | 7405971.298 | 3041054358.977 |  |
| 489000.0 | 7411195.867 | 3047282835.295 |  |
| 489500.0 | 7416418.662 | 3053517683.456 |  |
| 490000.0 | 7421639.675 | 3059758903.46 |  |
| 490500.0 | 7426858.919 | 3066006495.307 |  |
| 491000.0 | 7432076.391 | 3072260458.997 |  |
| 491500.0 | 7437292.094 | 3078520794.529 |  |
| 492000.0 | 7442506.032 | 3084787501.904 |  |
| 492500.0 | 7447718.2 | 3091060581.122 |  |
| 493000.0 | 7452928.611 | 3097340032.183 |  |
| 493500.0 | 7458137.262 | 3103625855.087 |  |
| 494000.0 | 7463344.161 | 3109918049.833 |  |
| 494500.0 | 7468549.302 | 3116216616.422 |  |
| 495000.0 | 7473752.687 | 3122521554.854 |  |
| 495500.0 | 7478954.328 | 3128832865.128 |  |
| 496000.0 | 7484154.22 | 3135150547.246 |  |
| 496500.0 | 7489352.366 | 3141474601.206 |  |
| 497000.0 | 7494548.769 | 3147805027.009 |  |
| 497500.0 | 7499743.43 | 3154141824.655 |  |
| 498000.0 | 7504936.355 | 3160484994.143 |  |
| 498500.0 | 7510127.546 | 3166834535.475 |  |
| 499000.0 | 7515317.001 | 3173190448.649 |  |
| 499500.0 | 7520504.728 | 3179552733.666 |  |
| 500000.0 | 7525690.724 | 3185921390.525 |  |
| 500500.0 | 7530874.993 | 3192296419.228 |  |
| 501000.0 | 7536057.542 | 3198677819.773 |  |
| 501500.0 | 7541238.364 | 3205065592.161 |  |
| 502000.0 | 7546417.47 | 3211459736.392 |  |
| 502500.0 | 7551594.857 | 3217860252.465 |  |
| 503000.0 | 7556770.53 | 3224267140.382 |  |
| 503500.0 | 7561944.487 | 3230680400.141 |  |
| 504000.0 | 7567116.736 | 3237100031.743 |  |
| 504500.0 | 7572287.277 | 3243526035.187 |  |
| 505000.0 | 7577456.112 | 3249958410.475 |  |
| 505500.0 | 7582623.245 | 3256397157.605 |  |
| 506000.0 | 7587788.675 | 3262842276.578 |  |
| 506500.0 | 7592952.405 | 3269293767.394 |  |
| 507000.0 | 7598114.439 | 3275751630.052 |  |
| 507500.0 | 7603274.777 | 3282215864.554 |  |
| 508000.0 | 7608433.42 | 3288686470.898 |  |
| 508500.0 | 7613590.377 | 3295163449.085 |  |
| 509000.0 | 7618745.644 | 3301646799.115 |  |
| 509500.0 | 7623899.226 | 3308136520.987 |  |
| 510000.0 | 7629051.125 | 3314632614.702 |  |
| 510500.0 | 7634201.344 | 3321135080.26 |  |
| 511000.0 | 7639349.88 | 3327643917.661 |  |
| 511500.0 | 7644496.738 | 3334159126.905 |  |
| 512000.0 | 7649641.926 | 3340680707.991 |  |
| 512500.0 | 7654785.437 | 3347208660.921 |  |
| 513000.0 | 7659927.278 | 3353742985.692 |  |
| 513500.0 | 7665067.451 | 3360283682.307 |  |
| 514000.0 | 7670205.96 | 3366830750.765 |  |
| 514500.0 | 7675342.8 | 3373384191.065 |  |
| 515000.0 | 7680477.98 | 3379944003.208 |  |
| 515500.0 | 7685611.505 | 3386510187.194 |  |
| 516000.0 | 7690743.366 | 3393082743.023 |  |
| 516500.0 | 7695873.574 | 3399661670.694 |  |
| 517000.0 | 7701002.127 | 3406246970.208 |  |
| 517500.0 | 7706129.032 | 3412838641.565 |  |
| 518000.0 | 7711254.284 | 3419436684.765 |  |
| 518500.0 | 7716377.892 | 3426041099.808 |  |
| 519000.0 | 7721499.856 | 3432651886.693 |  |
| 519500.0 | 7726620.174 | 3439269045.421 |  |
| 520000.0 | 7731738.853 | 3445892575.992 |  |
| 520500.0 | 7736855.893 | 3452522478.406 |  |
| 521000.0 | 7741971.297 | 3459158752.662 |  |
| 521500.0 | 7747085.067 | 3465801398.761 |  |
| 522000.0 | 7752197.202 | 3472450416.703 |  |
| 522500.0 | 7757307.713 | 3479105806.488 |  |
| 523000.0 | 7762416.589 | 3485767568.116 |  |
| 523500.0 | 7767523.843 | 3492435701.586 |  |
| 524000.0 | 7772629.47 | 3499110206.899 |  |
| 524500.0 | 7777733.475 | 3505791084.055 |  |
| 525000.0 | 7782835.86 | 3512478333.054 |  |
| 525500.0 | 7787936.631 | 3519171953.896 |  |
| 526000.0 | 7793035.781 | 3525871946.58 |  |
| 526500.0 | 7798133.322 | 3532578311.107 |  |
| 527000.0 | 7803229.248 | 3539291047.477 |  |
| 527500.0 | 7808323.567 | 3546010155.689 |  |
| 528000.0 | 7813416.277 | 3552735635.745 |  |
| 528500.0 | 7818507.383 | 3559467487.643 |  |
| 529000.0 | 7823596.885 | 3566205711.384 |  |
| 529500.0 | 7828684.78 | 3572950306.968 |  |
| 530000.0 | 7833771.079 | 3579701274.394 |  |
| 530500.0 | 7838855.784 | 3586458613.663 |  |
| 531000.0 | 7843938.888 | 3593222324.775 |  |
| 531500.0 | 7849020.402 | 3599992407.73 |  |
| 532000.0 | 7854100.322 | 3606768862.528 |  |
| 532500.0 | 7859178.653 | 3613551689.168 |  |
| 533000.0 | 7864255.399 | 3620340887.652 |  |
| 533500.0 | 7869330.558 | 3627136457.978 |  |
| 534000.0 | 7874404.133 | 3633938400.146 |  |
| 534500.0 | 7879476.124 | 3640746714.158 |  |
| 535000.0 | 7884546.541 | 3647561400.012 |  |
| 535500.0 | 7889615.379 | 3654382457.709 |  |
| 536000.0 | 7894682.637 | 3661209887.249 |  |
| 536500.0 | 7899748.324 | 3668043688.632 |  |
| 537000.0 | 7904812.441 | 3674883861.857 |  |
| 537500.0 | 7909874.983 | 3681730406.926 |  |
| 538000.0 | 7914935.963 | 3688583323.837 |  |
| 538500.0 | 7919995.371 | 3695442612.59 |  |
| 539000.0 | 7925053.219 | 3702308273.187 |  |
| 539500.0 | 7930109.501 | 3709180305.626 |  |
| 540000.0 | 7935164.225 | 3716058709.909 |  |
| 540500.0 | 7940217.396 | 3722943486.033 |  |
| 541000.0 | 7945269.003 | 3729834634.001 |  |
| 541500.0 | 7950319.061 | 3736732153.812 |  |
| 542000.0 | 7955367.563 | 3743636045.465 |  |
| 542500.0 | 7960414.51 | 3750546308.961 |  |
| 543000.0 | 7965459.916 | 3757462944.3 |  |
| 543500.0 | 7970503.776 | 3764385951.481 |  |
| 544000.0 | 7975546.086 | 3771315330.506 |  |
| 544500.0 | 7980586.854 | 3778251081.373 |  |
| 545000.0 | 7985626.084 | 3785193204.083 |  |
| 545500.0 | 7990663.771 | 3792141698.636 |  |
| 546000.0 | 7995699.92 | 3799096565.031 |  |
| 546500.0 | 8000734.536 | 3806057803.27 |  |
| 547000.0 | 8005767.615 | 3813025413.351 |  |
| 547500.0 | 8010799.17 | 3819999395.274 |  |
| 548000.0 | 8015829.188 | 3826979749.041 |  |
| 548500.0 | 8020857.678 | 3833966474.651 |  |
| 549000.0 | 8025884.645 | 3840959572.103 |  |
| 549500.0 | 8030910.087 | 3847959041.398 |  |
| 550000.0 | 8035934.006 | 3854964882.535 |  |
| 550500.0 | 8040956.402 | 3861977095.516 |  |
| 551000.0 | 8045977.285 | 3868995680.339 |  |
| 551500.0 | 8050996.642 | 3876020637.005 |  |
| 552000.0 | 8056014.489 | 3883051965.514 |  |
| 552500.0 | 8061030.827 | 3890089665.866 |  |
| 553000.0 | 8066045.648 | 3897133738.06 |  |
| 553500.0 | 8071058.958 | 3904184182.098 |  |
| 554000.0 | 8076070.763 | 3911240997.978 |  |
| 554500.0 | 8081081.064 | 3918304185.701 |  |
| 555000.0 | 8086089.856 | 3925373745.266 |  |
| 555500.0 | 8091097.149 | 3932449676.674 |  |
| 556000.0 | 8096102.94 | 3939531979.926 |  |
| 556500.0 | 8101107.231 | 3946620655.019 |  |
| 557000.0 | 8106110.026 | 3953715701.956 |  |
| 557500.0 | 8111111.33 | 3960817120.736 |  |
| 558000.0 | 8116111.135 | 3967924911.358 |  |
| 558500.0 | 8121109.45 | 3975039073.823 |  |
| 559000.0 | 8126106.273 | 3982159608.131 |  |
| 559500.0 | 8131101.609 | 3989286514.281 |  |
| 560000.0 | 8136095.462 | 3996419792.275 |  |
| 560500.0 | 8141087.829 | 4003559442.111 |  |
| 561000.0 | 8146078.713 | 4010705463.79 |  |
| 561500.0 | 8151068.113 | 4017857857.312 |  |
| 562000.0 | 8156056.035 | 4025016622.676 |  |
| 562500.0 | 8161042.477 | 4032181759.883 |  |
| 563000.0 | 8166027.45 | 4039353268.933 |  |
| 563500.0 | 8171010.945 | 4046531149.826 |  |
| 564000.0 | 8175992.966 | 4053715402.562 |  |
| 564500.0 | 8180973.519 | 4060906027.14 |  |
| 565000.0 | 8185952.601 | 4068103023.562 |  |
| 565500.0 | 8190930.217 | 4075306391.826 |  |
| 566000.0 | 8195906.366 | 4082516131.932 |  |
| 566500.0 | 8200881.057 | 4089732243.882 |  |
| 567000.0 | 8205854.283 | 4096954727.674 |  |
| 567500.0 | 8210826.048 | 4104183583.309 |  |
| 568000.0 | 8215796.354 | 4111418810.787 |  |
| 568500.0 | 8220765.198 | 4118660410.108 |  |
| 569000.0 | 8225732.597 | 4125908381.271 |  |
| 569500.0 | 8230698.538 | 4133162724.278 |  |
| 570000.0 | 8235663.023 | 4140423439.127 |  |
| 570500.0 | 8240626.065 | 4147690525.818 |  |
| 571000.0 | 8245587.657 | 4154963984.353 |  |
| 571500.0 | 8250547.803 | 4162243814.73 |  |
| 572000.0 | 8255506.497 | 4169530016.95 |  |
| 572500.0 | 8260463.752 | 4176822591.013 |  |
| 573000.0 | 8265419.569 | 4184121536.919 |  |
| 573500.0 | 8270373.939 | 4191426854.667 |  |
| 574000.0 | 8275326.879 | 4198738544.259 |  |
| 574500.0 | 8280278.378 | 4206056605.693 |  |
| 575000.0 | 8285228.443 | 4213381038.97 |  |
| 575500.0 | 8290177.073 | 4220711844.089 |  |
| 576000.0 | 8295124.274 | 4228049021.052 |  |
| 576500.0 | 8300070.039 | 4235392569.857 |  |
| 577000.0 | 8305014.383 | 4242742490.505 |  |
| 577500.0 | 8309957.299 | 4250098782.995 |  |
| 578000.0 | 8314898.789 | 4257461447.329 |  |
| 578500.0 | 8319838.855 | 4264830483.505 |  |
| 579000.0 | 8324777.499 | 4272205891.524 |  |
| 579500.0 | 8329714.721 | 4279587671.386 |  |
| 580000.0 | 8334650.531 | 4286975823.091 |  |
| 580500.0 | 8339584.918 | 4294370346.638 |  |
| 581000.0 | 8344517.888 | 4301771242.028 |  |
| 581500.0 | 8349449.458 | 4309178509.261 |  |
| 582000.0 | 8354379.601 | 4316592148.337 |  |
| 582500.0 | 8359308.339 | 4324012159.256 |  |
| 583000.0 | 8364235.672 | 4331438542.017 |  |
| 583500.0 | 8369161.594 | 4338871296.621 |  |
| 584000.0 | 8374086.11 | 4346310423.068 |  |
| 584500.0 | 8379009.219 | 4353755921.357 |  |
| 585000.0 | 8383930.934 | 4361207791.49 |  |
| 585500.0 | 8388851.238 | 4368666033.465 |  |
| 586000.0 | 8393770.154 | 4376130647.283 |  |
| 586500.0 | 8398687.666 | 4383601632.944 |  |
| 587000.0 | 8403603.782 | 4391078990.447 |  |
| 587500.0 | 8408518.502 | 4398562719.794 |  |
| 588000.0 | 8413431.834 | 4406052820.983 |  |
| 588500.0 | 8418343.774 | 4413549294.015 |  |
| 589000.0 | 8423254.321 | 4421052138.89 |  |
| 589500.0 | 8428163.485 | 4428561355.607 |  |
| 590000.0 | 8433071.259 | 4436076944.167 |  |
| 590500.0 | 8437977.652 | 4443598904.57 |  |
| 591000.0 | 8442882.655 | 4451127236.816 |  |
| 591500.0 | 8447786.279 | 4458661940.905 |  |
| 592000.0 | 8452688.519 | 4466203016.836 |  |
| 592500.0 | 8457589.391 | 4473750464.61 |  |
| 593000.0 | 8462488.873 | 4481304284.227 |  |
| 593500.0 | 8467386.989 | 4488864475.687 |  |
| 594000.0 | 8472283.729 | 4496431038.989 |  |
| 594500.0 | 8477179.094 | 4504003974.135 |  |
| 595000.0 | 8482073.087 | 4511583281.123 |  |
| 595500.0 | 8486965.714 | 4519168959.954 |  |
| 596000.0 | 8491856.976 | 4526761010.627 |  |
| 596500.0 | 8496746.864 | 4534359433.144 |  |
| 597000.0 | 8501635.391 | 4541964227.503 |  |
| 597500.0 | 8506522.551 | 4549575393.705 |  |
| 598000.0 | 8511408.35 | 4557192931.749 |  |
| 598500.0 | 8516292.793 | 4564816841.637 |  |
| 599000.0 | 8521175.874 | 4572447123.367 |  |
| 599500.0 | 8526057.6 | 4580083776.94 |  |
| 600000.0 | 8530937.966 | 4587726802.356 |  |
| 600500.0 | 8535816.982 | 4595376199.615 |  |
| 601000.0 | 8540694.645 | 4603031968.716 |  |
| 601500.0 | 8545570.957 | 4610694109.661 |  |
| 602000.0 | 8550445.919 | 4618362622.448 |  |
| 602500.0 | 8555319.528 | 4626037507.077 |  |
| 603000.0 | 8560191.798 | 4633718763.55 |  |
| 603500.0 | 8565062.721 | 4641406391.865 |  |
| 604000.0 | 8569932.291 | 4649100392.023 |  |
| 604500.0 | 8574800.529 | 4656800764.024 |  |
| 605000.0 | 8579667.423 | 4664507507.868 |  |
| 605500.0 | 8584532.973 | 4672220623.554 |  |
| 606000.0 | 8589397.19 | 4679940111.084 |  |
| 606500.0 | 8594260.074 | 4687665970.456 |  |
| 607000.0 | 8599121.614 | 4695398201.67 |  |
| 607500.0 | 8603981.826 | 4703136804.728 |  |
| 608000.0 | 8608840.705 | 4710881779.628 |  |
| 608500.0 | 8613698.253 | 4718633126.372 |  |
| 609000.0 | 8618554.474 | 4726390844.957 |  |
| 609500.0 | 8623409.367 | 4734154935.386 |  |
| 610000.0 | 8628262.93 | 4741925397.658 |  |
| 610500.0 | 8633115.169 | 4749702231.772 |  |
| 611000.0 | 8637966.089 | 4757485437.729 |  |
| 611500.0 | 8642815.681 | 4765275015.529 |  |
| 612000.0 | 8647663.955 | 4773070965.171 |  |
| 612500.0 | 8652510.91 | 4780873286.657 |  |
| 613000.0 | 8657356.555 | 4788681979.985 |  |
| 613500.0 | 8662200.873 | 4796497045.156 |  |
| 614000.0 | 8667043.887 | 4804318482.17 |  |
| 614500.0 | 8671885.578 | 4812146291.026 |  |
| 615000.0 | 8676725.961 | 4819980471.726 |  |
| 615500.0 | 8681565.03 | 4827821024.268 |  |
| 616000.0 | 8686402.791 | 4835667948.652 |  |
| 616500.0 | 8691239.252 | 4843521244.88 |  |
| 617000.0 | 8696074.402 | 4851380912.951 |  |
| 617500.0 | 8700908.239 | 4859246952.864 |  |
| 618000.0 | 8705740.781 | 4867119364.62 |  |
| 618500.0 | 8710572.017 | 4874998148.219 |  |
| 619000.0 | 8715401.961 | 4882883303.66 |  |
| 619500.0 | 8720230.593 | 4890774830.944 |  |
| 620000.0 | 8725057.941 | 4898672730.072 |  |
| 620500.0 | 8729883.98 | 4906577001.041 |  |
| 621000.0 | 8734708.73 | 4914487643.854 |  |
| 621500.0 | 8739532.186 | 4922404658.51 |  |
| 622000.0 | 8744354.349 | 4930328045.008 |  |
| 622500.0 | 8749175.227 | 4938257803.349 |  |
| 623000.0 | 8753994.802 | 4946193933.533 |  |
| 623500.0 | 8758813.104 | 4954136435.559 |  |
| 624000.0 | 8763630.109 | 4962085309.429 |  |
| 624500.0 | 8768445.83 | 4970040555.141 |  |
| 625000.0 | 8773260.271 | 4978002172.696 |  |
| 625500.0 | 8778073.433 | 4985970162.093 |  |
| 626000.0 | 8782885.3 | 4993944523.334 |  |
| 626500.0 | 8787695.902 | 5001925256.417 |  |
| 627000.0 | 8792505.219 | 5009912361.343 |  |
| 627500.0 | 8797313.259 | 5017905838.112 |  |
| 628000.0 | 8802120.017 | 5025905686.724 |  |
| 628500.0 | 8806925.512 | 5033911907.178 |  |
| 629000.0 | 8811729.725 | 5041924499.475 |  |
| 629500.0 | 8816532.673 | 5049943463.615 |  |
| 630000.0 | 8821334.347 | 5057968799.598 |  |
| 630500.0 | 8826134.751 | 5066000507.423 |  |
| 631000.0 | 8830933.889 | 5074038587.092 |  |
| 631500.0 | 8835731.759 | 5082083038.603 |  |
| 632000.0 | 8840528.361 | 5090133861.957 |  |
| 632500.0 | 8845323.704 | 5098191057.153 |  |
| 633000.0 | 8850117.782 | 5106254624.193 |  |
| 633500.0 | 8854910.6 | 5114324563.075 |  |
| 634000.0 | 8859702.163 | 5122400873.8 |  |
| 634500.0 | 8864492.461 | 5130483556.368 |  |
| 635000.0 | 8869281.503 | 5138572610.778 |  |
| 635500.0 | 8874069.298 | 5146668037.031 |  |
| 636000.0 | 8878855.824 | 5154769835.127 |  |
| 636500.0 | 8883641.11 | 5162878005.066 |  |
| 637000.0 | 8888425.135 | 5170992546.848 |  |
| 637500.0 | 8893207.914 | 5179113460.472 |  |
| 638000.0 | 8897989.437 | 5187240745.94 |  |
| 638500.0 | 8902769.722 | 5195374403.25 |  |
| 639000.0 | 8907548.751 | 5203514432.403 |  |
| 639500.0 | 8912326.544 | 5211660833.398 |  |
| 640000.0 | 8917103.086 | 5219813606.236 |  |
| 640500.0 | 8921878.389 | 5227972750.918 |  |
| 641000.0 | 8926652.45 | 5236138267.441 |  |
| 641500.0 | 8931425.274 | 5244310155.808 |  |
| 642000.0 | 8936196.848 | 5252488416.018 |  |
| 642500.0 | 8940967.199 | 5260673048.07 |  |
| 643000.0 | 8945736.306 | 5268864051.965 |  |
| 643500.0 | 8950504.177 | 5277061427.703 |  |
| 644000.0 | 8955270.814 | 5285265175.283 |  |
| 644500.0 | 8960036.224 | 5293475294.707 |  |
| 645000.0 | 8964800.392 | 5301691785.973 |  |
| 645500.0 | 8969563.337 | 5309914649.082 |  |
| 646000.0 | 8974325.051 | 5318143884.034 |  |
| 646500.0 | 8979085.547 | 5326379490.828 |  |
| 647000.0 | 8983844.807 | 5334621469.465 |  |
| 647500.0 | 8988602.846 | 5342869819.945 |  |
| 648000.0 | 8993359.656 | 5351124542.268 |  |
| 648500.0 | 8998115.251 | 5359385636.434 |  |
| 649000.0 | 9002869.624 | 5367653102.442 |  |
| 649500.0 | 9007622.771 | 5375926940.294 |  |
| 650000.0 | 9012374.705 | 5384207149.988 |  |
| 650500.0 | 9017125.429 | 5392493731.524 |  |
| 651000.0 | 9021874.919 | 5400786684.904 |  |
| 651500.0 | 9026623.208 | 5409086010.126 |  |
| 652000.0 | 9031370.281 | 5417391707.191 |  |
| 652500.0 | 9036116.141 | 5425703776.099 |  |
| 653000.0 | 9040860.782 | 5434022216.85 |  |
| 653500.0 | 9045604.218 | 5442347029.443 |  |
| 654000.0 | 9050346.451 | 5450678213.879 |  |
| 654500.0 | 9055087.466 | 5459015770.158 |  |
| 655000.0 | 9059827.293 | 5467359698.28 |  |
| 655500.0 | 9064565.896 | 5475709998.245 |  |
| 656000.0 | 9069303.306 | 5484066670.052 |  |
| 656500.0 | 9074039.505 | 5492429713.702 |  |
| 657000.0 | 9078774.513 | 5500799129.195 |  |
| 657500.0 | 9083508.31 | 5509174916.531 |  |
| 658000.0 | 9088240.916 | 5517557075.709 |  |
| 658500.0 | 9092972.32 | 5525945606.731 |  |
| 659000.0 | 9097702.53 | 5534340509.595 |  |
| 659500.0 | 9102431.543 | 5542741784.301 |  |
| 660000.0 | 9107159.365 | 5551149430.851 |  |
| 660500.0 | 9111885.994 | 5559563449.243 |  |
| 661000.0 | 9116611.423 | 5567983839.479 |  |
| 661500.0 | 9121335.677 | 5576410601.557 |  |
| 662000.0 | 9126058.728 | 5584843735.477 |  |
| 662500.0 | 9130780.599 | 5593283241.241 |  |
| 663000.0 | 9135501.281 | 5601729118.847 |  |
| 663500.0 | 9140220.774 | 5610181368.296 |  |
| 664000.0 | 9144939.086 | 5618639989.588 |  |
| 664500.0 | 9149656.216 | 5627104982.723 |  |
| 665000.0 | 9154372.159 | 5635576347.7 |  |
| 665500.0 | 9159086.921 | 5644054084.52 |  |
| 666000.0 | 9163800.507 | 5652538193.183 |  |
| 666500.0 | 9168512.918 | 5661028673.689 |  |
| 667000.0 | 9173224.146 | 5669525526.037 |  |
| 667500.0 | 9177934.201 | 5678028750.229 |  |
| 668000.0 | 9182643.082 | 5686538346.263 |  |
| 668500.0 | 9187350.784 | 5695054314.14 |  |
| 669000.0 | 9192057.315 | 5703576653.859 |  |
| 669500.0 | 9196762.678 | 5712105365.422 |  |
| 670000.0 | 9201466.865 | 5720640448.827 |  |
| 670500.0 | 9206169.888 | 5729181904.075 |  |
| 671000.0 | 9210871.744 | 5737729731.166 |  |
| 671500.0 | 9215572.422 | 5746283930.099 |  |
| 672000.0 | 9220271.948 | 5754844500.876 |  |
| 672500.0 | 9224970.294 | 5763411443.495 |  |
| 673000.0 | 9229667.495 | 5771984757.957 |  |
| 673500.0 | 9234363.529 | 5780564444.261 |  |
| 674000.0 | 9239058.394 | 5789150502.409 |  |
| 674500.0 | 9243752.098 | 5797742932.399 |  |
| 675000.0 | 9248444.646 | 5806341734.232 |  |
| 675500.0 | 9253136.049 | 5814946907.908 |  |
| 676000.0 | 9257826.277 | 5823558453.427 |  |
| 676500.0 | 9262515.361 | 5832176370.788 |  |
| 677000.0 | 9267203.285 | 5840800659.992 |  |
| 677500.0 | 9271890.054 | 5849431321.039 |  |
| 678000.0 | 9276575.682 | 5858068353.929 |  |
| 678500.0 | 9281260.156 | 5866711758.661 |  |
| 679000.0 | 9285943.474 | 5875361535.236 |  |
| 679500.0 | 9290625.642 | 5884017683.655 |  |
| 680000.0 | 9295306.675 | 5892680203.915 |  |
| 680500.0 | 9299986.55 | 5901349096.019 |  |
| 681000.0 | 9304665.289 | 5910024359.965 |  |
| 681500.0 | 9309342.875 | 5918705995.755 |  |
| 682000.0 | 9314019.324 | 5927394003.387 |  |
| 682500.0 | 9318694.625 | 5936088382.861 |  |
| 683000.0 | 9323368.787 | 5944789134.179 |  |
| 683500.0 | 9328041.807 | 5953496257.339 |  |
| 684000.0 | 9332713.699 | 5962209752.342 |  |
| 684500.0 | 9337384.442 | 5970929619.188 |  |
| 685000.0 | 9342054.056 | 5979655857.877 |  |
| 685500.0 | 9346722.535 | 5988388468.408 |  |
| 686000.0 | 9351389.873 | 5997127450.782 |  |
| 686500.0 | 9356056.09 | 6005872804.999 |  |
| 687000.0 | 9360721.162 | 6014624531.059 |  |
| 687500.0 | 9365385.117 | 6023382628.962 |  |
| 688000.0 | 9370047.933 | 6032147098.707 |  |
| 688500.0 | 9374709.62 | 6040917940.295 |  |
| 689000.0 | 9379370.175 | 6049695153.726 |  |
| 689500.0 | 9384029.611 | 6058478739 |  |
| 690000.0 | 9388687.929 | 6067268696.116 |  |
| 690500.0 | 9393345.114 | 6076065025.075 |  |
| 691000.0 | 9398001.17 | 6084867725.877 |  |
| 691500.0 | 9402656.111 | 6093676798.522 |  |
| 692000.0 | 9407309.934 | 6102492243.01 |  |
| 692500.0 | 9411962.632 | 6111314059.34 |  |
| 693000.0 | 9416614.209 | 6120142247.513 |  |
| 693500.0 | 9421264.673 | 6128976807.529 |  |
| 694000.0 | 9425914.02 | 6137817739.388 |  |
| 694500.0 | 9430562.241 | 6146665043.089 |  |
| 695000.0 | 9435209.356 | 6155518718.634 |  |
| 695500.0 | 9439855.362 | 6164378766.021 |  |
| 696000.0 | 9444500.262 | 6173245185.251 |  |
| 696500.0 | 9449144.029 | 6182117976.323 |  |
| 697000.0 | 9453786.707 | 6190997139.239 |  |
| 697500.0 | 9458428.262 | 6199882673.997 |  |
| 698000.0 | 9463068.706 | 6208774580.598 |  |
| 698500.0 | 9467708.055 | 6217672859.041 |  |
| 699000.0 | 9472346.289 | 6226577509.328 |  |
| 699500.0 | 9476983.43 | 6235488531.457 |  |
| 700000.0 | 9481619.459 | 6244405925.429 |  |
| 700500.0 | 9486254.378 | 6253329691.244 |  |
| 701000.0 | 9490888.197 | 6262259828.902 |  |
| 701500.0 | 9495520.919 | 6271196338.402 |  |
| 702000.0 | 9500152.547 | 6280139219.745 |  |
| 702500.0 | 9504783.075 | 6289088472.931 |  |
| 703000.0 | 9509412.495 | 6298044097.96 |  |
| 703500.0 | 9514040.831 | 6307006094.832 |  |
| 704000.0 | 9518668.066 | 6315974463.546 |  |
| 704500.0 | 9523294.201 | 6324949204.103 |  |
| 705000.0 | 9527919.259 | 6333930316.503 |  |
| 705500.0 | 9532543.208 | 6342917800.746 |  |
| 706000.0 | 9537166.073 | 6351911656.831 |  |
| 706500.0 | 9541787.837 | 6360911884.759 |  |
| 707000.0 | 9546408.528 | 6369918484.53 |  |
| 707500.0 | 9551028.12 | 6378931456.144 |  |
| 708000.0 | 9555646.618 | 6387950799.601 |  |
| 708500.0 | 9560264.049 | 6396976514.9 |  |
| 709000.0 | 9564880.382 | 6406008602.042 |  |
| 709500.0 | 9569495.635 | 6415047061.027 |  |
| 710000.0 | 9574109.804 | 6424091891.855 |  |
| 710500.0 | 9578722.883 | 6433143094.525 |  |
| 711000.0 | 9583334.886 | 6442200669.039 |  |
| 711500.0 | 9587945.807 | 6451264615.395 |  |
| 712000.0 | 9592555.661 | 6460334933.594 |  |
| 712500.0 | 9597164.434 | 6469411623.635 |  |
| 713000.0 | 9601772.117 | 6478494685.52 |  |
| 713500.0 | 9606378.722 | 6487584119.247 |  |
| 714000.0 | 9610984.268 | 6496679924.817 |  |
| 714500.0 | 9615588.732 | 6505782102.229 |  |
| 715000.0 | 9620192.122 | 6514890651.485 |  |
| 715500.0 | 9624794.44 | 6524005572.583 |  |
| 716000.0 | 9629395.683 | 6533126865.524 |  |
| 716500.0 | 9633995.857 | 6542254530.308 |  |
| 717000.0 | 9638594.974 | 6551388566.935 |  |
| 717500.0 | 9643193.012 | 6560528975.404 |  |
| 718000.0 | 9647789.987 | 6569675755.716 |  |
| 718500.0 | 9652385.891 | 6578828907.871 |  |
| 719000.0 | 9656980.727 | 6587988431.869 |  |
| 719500.0 | 9661574.504 | 6597154327.71 |  |
| 720000.0 | 9666167.225 | 6606326595.393 |  |
| 720500.0 | 9670758.873 | 6615505234.919 |  |
| 721000.0 | 9675349.466 | 6624690246.288 |  |
| 721500.0 | 9679938.989 | 6633881629.5 |  |
| 722000.0 | 9684527.472 | 6643079384.554 |  |
| 722500.0 | 9689114.876 | 6652283511.451 |  |
| 723000.0 | 9693701.232 | 6661494010.191 |  |
| 723500.0 | 9698286.528 | 6670710880.774 |  |
| 724000.0 | 9702870.77 | 6679934123.2 |  |
| 724500.0 | 9707453.958 | 6689163737.468 |  |
| 725000.0 | 9712036.087 | 6698399723.579 |  |
| 725500.0 | 9716617.172 | 6707642081.533 |  |
| 726000.0 | 9721197.206 | 6716890811.33 |  |
| 726500.0 | 9725776.192 | 6726145912.969 |  |
| 727000.0 | 9730354.124 | 6735407386.452 |  |
| 727500.0 | 9734931.005 | 6744675231.777 |  |
| 728000.0 | 9739506.843 | 6753949448.944 |  |
| 728500.0 | 9744081.627 | 6763230037.955 |  |
| 729000.0 | 9748655.367 | 6772516998.808 |  |
| 729500.0 | 9753228.065 | 6781810331.505 |  |
| 730000.0 | 9757799.715 | 6791110036.043 |  |
| 730500.0 | 9762370.322 | 6800416112.425 |  |
| 731000.0 | 9766939.894 | 6809728560.65 |  |
| 731500.0 | 9771508.42 | 6819047380.717 |  |
| 732000.0 | 9776075.91 | 6828372572.627 |  |
| 732500.0 | 9780642.35 | 6837704136.38 |  |
| 733000.0 | 9785207.766 | 6847042071.976 |  |
| 733500.0 | 9789772.13 | 6856386379.414 |  |
| 734000.0 | 9794335.466 | 6865737058.695 |  |
| 734500.0 | 9798897.774 | 6875094109.819 |  |
| 735000.0 | 9803459.036 | 6884457532.786 |  |
| 735500.0 | 9808019.267 | 6893827327.595 |  |
| 736000.0 | 9812578.474 | 6903203494.248 |  |
| 736500.0 | 9817136.643 | 6912586032.743 |  |
| 737000.0 | 9821693.782 | 6921974943.081 |  |
| 737500.0 | 9826249.877 | 6931370225.261 |  |
| 738000.0 | 9830804.961 | 6940771879.285 |  |
| 738500.0 | 9835359.006 | 6950179905.151 |  |
| 739000.0 | 9839912.031 | 6959594302.86 |  |
| 739500.0 | 9844464.034 | 6969015072.412 |  |
| 740000.0 | 9849015.006 | 6978442213.806 |  |
| 740500.0 | 9853564.957 | 6987875727.044 |  |
| 741000.0 | 9858113.876 | 6997315612.124 |  |
| 741500.0 | 9862661.787 | 7006761869.047 |  |
| 742000.0 | 9867208.665 | 7016214497.812 |  |
| 742500.0 | 9871754.532 | 7025673498.421 |  |
| 743000.0 | 9876299.374 | 7035138870.872 |  |
| 743500.0 | 9880843.198 | 7044610615.166 |  |
| 744000.0 | 9885385.99 | 7054088731.303 |  |
| 744500.0 | 9889927.785 | 7063573219.283 |  |
| 745000.0 | 9894468.565 | 7073064079.105 |  |
| 745500.0 | 9899008.32 | 7082561310.77 |  |
| 746000.0 | 9903547.061 | 7092064914.278 |  |
| 746500.0 | 9908084.79 | 7101574889.629 |  |
| 747000.0 | 9912621.501 | 7111091236.822 |  |
| 747500.0 | 9917157.21 | 7120613955.859 |  |
| 748000.0 | 9921691.909 | 7130143046.738 |  |
| 748500.0 | 9926225.596 | 7139678509.459 |  |
| 749000.0 | 9930758.277 | 7149220344.024 |  |
| 749500.0 | 9935289.933 | 7158768550.431 |  |
| 750000.0 | 9939820.597 | 7168323128.682 |  |
| 750500.0 | 9944350.264 | 7177884078.775 |  |
| 751000.0 | 9948878.918 | 7187451400.71 |  |
| 751500.0 | 9953406.568 | 7197025094.489 |  |
| 752000.0 | 9957933.195 | 7206605160.11 |  |
| 752500.0 | 9962458.85 | 7216191597.574 |  |
| 753000.0 | 9966983.484 | 7225784406.881 |  |
| 753500.0 | 9971507.114 | 7235383588.031 |  |
| 754000.0 | 9976029.762 | 7244989141.023 |  |
| 754500.0 | 9980551.4 | 7254601065.858 |  |
| 755000.0 | 9985072.046 | 7264219362.536 |  |
| 755500.0 | 9989591.683 | 7273844031.057 |  |
| 756000.0 | 9994110.344 | 7283475071.421 |  |
| 756500.0 | 9998627.992 | 7293112483.627 |  |
| 757000.0 | 10003144.643 | 7302756267.676 |  |
| 757500.0 | 10007660.319 | 7312406423.568 |  |
| 758000.0 | 10012174.984 | 7322062951.303 |  |
| 758500.0 | 10016688.675 | 7331725850.88 |  |
| 759000.0 | 10021201.352 | 7341395122.301 |  |
| 759500.0 | 10025713.048 | 7351070765.564 |  |
| 760000.0 | 10030223.768 | 7360752780.669 |  |
| 760500.0 | 10034733.478 | 7370441167.618 |  |
| 761000.0 | 10039242.211 | 7380135926.409 |  |
| 761500.0 | 10043749.962 | 7389837057.043 |  |
| 762000.0 | 10048256.729 | 7399544559.52 |  |
| 762500.0 | 10052762.503 | 7409258433.84 |  |
| 763000.0 | 10057267.293 | 7418978680.003 |  |
| 763500.0 | 10061771.103 | 7428705298.008 |  |
| 764000.0 | 10066273.923 | 7438438287.856 |  |
| 764500.0 | 10070775.769 | 7448177649.547 |  |
| 765000.0 | 10075276.644 | 7457923383.08 |  |
| 765500.0 | 10079776.51 | 7467675488.457 |  |
| 766000.0 | 10084275.415 | 7477433965.676 |  |
| 766500.0 | 10088773.35 | 7487198814.738 |  |
| 767000.0 | 10093270.294 | 7496970035.643 |  |
| 767500.0 | 10097766.265 | 7506747628.39 |  |
| 768000.0 | 10102261.273 | 7516531592.98 |  |
| 768500.0 | 10106755.281 | 7526321929.414 |  |
| 769000.0 | 10111248.343 | 7536118637.689 |  |
| 769500.0 | 10115740.42 | 7545921717.808 |  |
| 770000.0 | 10120231.527 | 7555731169.77 |  |
| 770500.0 | 10124721.653 | 7565546993.574 |  |
| 771000.0 | 10129210.809 | 7575369189.221 |  |
| 771500.0 | 10133698.998 | 7585197756.71 |  |
| 772000.0 | 10138186.224 | 7595032696.043 |  |
| 772500.0 | 10142672.485 | 7604874007.218 |  |
| 773000.0 | 10147157.766 | 7614721690.236 |  |
| 773500.0 | 10151642.092 | 7624575745.097 |  |
| 774000.0 | 10156125.442 | 7634436171.801 |  |
| 774500.0 | 10160607.838 | 7644302970.348 |  |
| 775000.0 | 10165089.254 | 7654176140.737 |  |
| 775500.0 | 10169569.738 | 7664055682.969 |  |
| 776000.0 | 10174049.229 | 7673941597.044 |  |
| 776500.0 | 10178527.768 | 7683833882.961 |  |
| 777000.0 | 10183005.355 | 7693732540.722 |  |
| 777500.0 | 10187481.977 | 7703637570.325 |  |
| 778000.0 | 10191957.628 | 7713548971.771 |  |
| 778500.0 | 10196432.341 | 7723466745.059 |  |
| 779000.0 | 10200906.087 | 7733390890.191 |  |
| 779500.0 | 10205378.877 | 7743321407.165 |  |
| 780000.0 | 10209850.711 | 7753258295.982 |  |
| 780500.0 | 10214321.592 | 7763201556.642 |  |
| 781000.0 | 10218791.517 | 7773151189.145 |  |
| 781500.0 | 10223260.483 | 7783107193.49 |  |
| 782000.0 | 10227728.497 | 7793069569.678 |  |
| 782500.0 | 10232195.57 | 7803038317.709 |  |
| 783000.0 | 10236661.683 | 7813013437.583 |  |
| 783500.0 | 10241126.859 | 7822994929.299 |  |
| 784000.0 | 10245591.074 | 7832982792.859 |  |
| 784500.0 | 10250054.346 | 7842977028.261 |  |
| 785000.0 | 10254516.66 | 7852977635.506 |  |
| 785500.0 | 10258978.028 | 7862984614.593 |  |
| 786000.0 | 10263438.467 | 7872997965.524 |  |
| 786500.0 | 10267897.961 | 7883017688.297 |  |
| 787000.0 | 10272356.488 | 7893043782.913 |  |
| 787500.0 | 10276814.096 | 7903076249.372 |  |
| 788000.0 | 10281270.737 | 7913115087.673 |  |
| 788500.0 | 10285726.456 | 7923160297.817 |  |
| 789000.0 | 10290181.213 | 7933211879.804 |  |
| 789500.0 | 10294635.047 | 7943269833.634 |  |
| 790000.0 | 10299087.949 | 7953334159.307 |  |
| 790500.0 | 10303539.896 | 7963404856.823 |  |
| 791000.0 | 10307990.908 | 7973481926.181 |  |
| 791500.0 | 10312440.991 | 7983565367.382 |  |
| 792000.0 | 10316890.123 | 7993655180.426 |  |
| 792500.0 | 10321338.339 | 8003751365.312 |  |
| 793000.0 | 10325785.609 | 8013853922.041 |  |
| 793500.0 | 10330231.944 | 8023962850.614 |  |
| 794000.0 | 10334677.342 | 8034078151.029 |  |
| 794500.0 | 10339121.808 | 8044199823.286 |  |
| 795000.0 | 10343565.351 | 8054327867.387 |  |
| 795500.0 | 10348007.968 | 8064462283.33 |  |
| 796000.0 | 10352449.642 | 8074603071.116 |  |
| 796500.0 | 10356890.381 | 8084750230.745 |  |
| 797000.0 | 10361330.199 | 8094903762.216 |  |
| 797500.0 | 10365769.096 | 8105063665.531 |  |
| 798000.0 | 10370207.058 | 8115229940.688 |  |
| 798500.0 | 10374644.097 | 8125402587.688 |  |
| 799000.0 | 10379080.21 | 8135581606.531 |  |
| 799500.0 | 10383515.402 | 8145766997.216 |  |
| 800000.0 | 10387949.662 | 8155958759.744 |  |
| 800500.0 | 10392383.004 | 8166156894.116 |  |
| 801000.0 | 10396815.429 | 8176361400.329 |  |
| 801500.0 | 10401246.925 | 8186572278.386 |  |
| 802000.0 | 10405677.504 | 8196789528.285 |  |
| 802500.0 | 10410107.163 | 8207013150.028 |  |
| 803000.0 | 10414535.887 | 8217243143.613 |  |
| 803500.0 | 10418963.705 | 8227479509.04 |  |
| 804000.0 | 10423390.61 | 8237722246.311 |  |
| 804500.0 | 10427816.586 | 8247971355.424 |  |
| 805000.0 | 10432241.656 | 8258226836.38 |  |
| 805500.0 | 10436665.813 | 8268488689.179 |  |
| 806000.0 | 10441089.055 | 8278756913.821 |  |
| 806500.0 | 10445511.365 | 8289031510.305 |  |
| 807000.0 | 10449932.77 | 8299312478.633 |  |
| 807500.0 | 10454353.284 | 8309599818.803 |  |
| 808000.0 | 10458772.867 | 8319893530.815 |  |
| 808500.0 | 10463191.543 | 8330193614.671 |  |
| 809000.0 | 10467609.303 | 8340500070.369 |  |
| 809500.0 | 10472026.161 | 8350812897.91 |  |
| 810000.0 | 10476442.1 | 8361132097.294 |  |
| 810500.0 | 10480857.145 | 8371457668.521 |  |
| 811000.0 | 10485271.268 | 8381789611.59 |  |
| 811500.0 | 10489684.485 | 8392127926.503 |  |
| 812000.0 | 10494096.8 | 8402472613.258 |  |
| 812500.0 | 10498508.219 | 8412823671.856 |  |
| 813000.0 | 10502918.736 | 8423181102.296 |  |
| 813500.0 | 10507328.348 | 8433544904.58 |  |
| 814000.0 | 10511737.039 | 8443915078.706 |  |
| 814500.0 | 10516144.838 | 8454291624.675 |  |
| 815000.0 | 10520551.737 | 8464674542.486 |  |
| 815500.0 | 10524957.736 | 8475063832.141 |  |
| 816000.0 | 10529362.839 | 8485459493.638 |  |
| 816500.0 | 10533767.034 | 8495861526.978 |  |
| 817000.0 | 10538170.337 | 8506269932.161 |  |
| 817500.0 | 10542572.747 | 8516684709.187 |  |
| 818000.0 | 10546974.247 | 8527105858.055 |  |
| 818500.0 | 10551374.848 | 8537533378.766 |  |
| 819000.0 | 10555774.584 | 8547967271.32 |  |
| 819500.0 | 10560173.394 | 8558407535.717 |  |
| 820000.0 | 10564571.323 | 8568854171.957 |  |
| 820500.0 | 10568968.36 | 8579307180.039 |  |
| 821000.0 | 10573364.501 | 8589766559.964 |  |
| 821500.0 | 10577759.743 | 8600232311.732 |  |
| 822000.0 | 10582154.092 | 8610704435.342 |  |
| 822500.0 | 10586547.578 | 8621182930.796 |  |
| 823000.0 | 10590940.133 | 8631667798.092 |  |
| 823500.0 | 10595331.838 | 8642159037.231 |  |
| 824000.0 | 10599722.635 | 8652656648.213 |  |
| 824500.0 | 10604112.555 | 8663160631.037 |  |
| 825000.0 | 10608501.569 | 8673670985.705 |  |
| 825500.0 | 10612889.718 | 8684187712.215 |  |
| 826000.0 | 10617276.962 | 8694710810.568 |  |
| 826500.0 | 10621663.332 | 8705240280.764 |  |
| 827000.0 | 10626048.819 | 8715776122.802 |  |
| 827500.0 | 10630433.42 | 8726318336.683 |  |
| 828000.0 | 10634817.138 | 8736866922.407 |  |
| 828500.0 | 10639199.981 | 8747421879.974 |  |
| 829000.0 | 10643581.938 | 8757983209.384 |  |
| 829500.0 | 10647963.027 | 8768550910.636 |  |
| 830000.0 | 10652343.206 | 8779124983.731 |  |
| 830500.0 | 10656722.524 | 8789705428.669 |  |
| 831000.0 | 10661100.97 | 8800292245.45 |  |
| 831500.0 | 10665478.539 | 8810885434.073 |  |
| 832000.0 | 10669855.228 | 8821484994.54 |  |
| 832500.0 | 10674231.043 | 8832090926.849 |  |
| 833000.0 | 10678605.971 | 8842703231.001 |  |
| 833500.0 | 10682980.026 | 8853321906.995 |  |
| 834000.0 | 10687353.204 | 8863946954.833 |  |
| 834500.0 | 10691725.53 | 8874578374.513 |  |
| 835000.0 | 10696096.967 | 8885216166.036 |  |
| 835500.0 | 10700467.526 | 8895860329.401 |  |
| 836000.0 | 10704837.225 | 8906510864.61 |  |
| 836500.0 | 10709206.063 | 8917167771.661 |  |
| 837000.0 | 10713574.001 | 8927831050.555 |  |
| 837500.0 | 10717941.091 | 8938500701.292 |  |
| 838000.0 | 10722307.305 | 8949176723.872 |  |
| 838500.0 | 10726672.661 | 8959859118.294 |  |
| 839000.0 | 10731037.138 | 8970547884.559 |  |
| 839500.0 | 10735400.767 | 8981243022.667 |  |
| 840000.0 | 10739763.513 | 8991944532.618 |  |
| 840500.0 | 10744125.393 | 9002652414.412 |  |
| 841000.0 | 10748486.406 | 9013366668.048 |  |
| 841500.0 | 10752846.578 | 9024087293.527 |  |
| 842000.0 | 10757205.872 | 9034814290.849 |  |
| 842500.0 | 10761564.301 | 9045547660.014 |  |
| 843000.0 | 10765921.862 | 9056287401.021 |  |
| 843500.0 | 10770278.575 | 9067033513.872 |  |
| 844000.0 | 10774634.425 | 9077785998.565 |  |
| 844500.0 | 10778989.42 | 9088544855.1 |  |
| 845000.0 | 10783343.552 | 9099310083.479 |  |
| 845500.0 | 10787696.818 | 9110081683.7 |  |
| 846000.0 | 10792049.242 | 9120859655.764 |  |
| 846500.0 | 10796400.783 | 9131643999.671 |  |
| 847000.0 | 10800751.499 | 9142434715.421 |  |
| 847500.0 | 10805101.336 | 9153231803.014 |  |
| 848000.0 | 10809450.336 | 9164035262.449 |  |
| 848500.0 | 10813798.48 | 9174845093.727 |  |
| 849000.0 | 10818145.749 | 9185661296.848 |  |
| 849500.0 | 10822492.179 | 9196483871.811 |  |
| 850000.0 | 10826837.761 | 9207312818.618 |  |
| 850500.0 | 10831182.493 | 9218148137.267 |  |
| 851000.0 | 10835526.355 | 9228989827.759 |  |
| 851500.0 | 10839869.398 | 9239837890.094 |  |
| 852000.0 | 10844211.565 | 9250692324.271 |  |
| 852500.0 | 10848552.894 | 9261553130.291 |  |
| 853000.0 | 10852893.384 | 9272420308.155 |  |
| 853500.0 | 10857233.011 | 9283293857.86 |  |
| 854000.0 | 10861571.806 | 9294173779.409 |  |
| 854500.0 | 10865909.732 | 9305060072.8 |  |
| 855000.0 | 10870246.83 | 9315952738.035 |  |
| 855500.0 | 10874583.071 | 9326851775.112 |  |
| 856000.0 | 10878918.48 | 9337757184.031 |  |
| 856500.0 | 10883253.04 | 9348668964.794 |  |
| 857000.0 | 10887586.761 | 9359587117.399 |  |
| 857500.0 | 10891919.633 | 9370511641.847 |  |
| 858000.0 | 10896251.676 | 9381442538.138 |  |
| 858500.0 | 10900582.867 | 9392379806.272 |  |
| 859000.0 | 10904913.209 | 9403323446.248 |  |
| 859500.0 | 10909242.735 | 9414273458.068 |  |
| 860000.0 | 10913571.388 | 9425229841.73 |  |
| 860500.0 | 10917899.234 | 9436192597.234 |  |
| 861000.0 | 10922226.246 | 9447161724.582 |  |
| 861500.0 | 10926552.405 | 9458137223.772 |  |
| 862000.0 | 10930877.717 | 9469119094.806 |  |
| 862500.0 | 10935202.218 | 9480107337.681 |  |
| 863000.0 | 10939525.878 | 9491101952.4 |  |
| 863500.0 | 10943848.692 | 9502102938.962 |  |
| 864000.0 | 10948170.661 | 9513110297.366 |  |
| 864500.0 | 10952491.816 | 9524124027.613 |  |
| 865000.0 | 10956812.141 | 9535144129.703 |  |
| 865500.0 | 10961131.628 | 9546170603.635 |  |
| 866000.0 | 10965450.294 | 9557203449.411 |  |
| 866500.0 | 10969768.09 | 9568242667.029 |  |
| 867000.0 | 10974085.092 | 9579288256.49 |  |
| 867500.0 | 10978401.259 | 9590340217.794 |  |
| 868000.0 | 10982716.603 | 9601398550.94 |  |
| 868500.0 | 10987031.115 | 9612463255.929 |  |
| 869000.0 | 10991344.791 | 9623534332.762 |  |
| 869500.0 | 10995657.657 | 9634611781.436 |  |
| 870000.0 | 10999969.667 | 9645695601.954 |  |
| 870500.0 | 11004280.88 | 9656785794.314 |  |
| 871000.0 | 11008591.26 | 9667882358.518 |  |
| 871500.0 | 11012900.825 | 9678985294.564 |  |
| 872000.0 | 11017209.546 | 9690094602.452 |  |
| 872500.0 | 11021517.45 | 9701210282.184 |  |
| 873000.0 | 11025824.543 | 9712332333.758 |  |
| 873500.0 | 11030130.81 | 9723460757.175 |  |
| 874000.0 | 11034436.239 | 9734595552.435 |  |
| 874500.0 | 11038740.85 | 9745736719.538 |  |
| 875000.0 | 11043044.665 | 9756884258.483 |  |
| 875500.0 | 11047347.661 | 9768038169.272 |  |
| 876000.0 | 11051649.819 | 9779198451.903 |  |
| 876500.0 | 11055951.175 | 9790365106.376 |  |
| 877000.0 | 11060251.692 | 9801538132.693 |  |
| 877500.0 | 11064551.39 | 9812717530.852 |  |
| 878000.0 | 11068850.291 | 9823903300.854 |  |
| 878500.0 | 11073148.373 | 9835095442.699 |  |
| 879000.0 | 11077445.641 | 9846293956.387 |  |
| 879500.0 | 11081742.08 | 9857498841.918 |  |
| 880000.0 | 11086037.73 | 9868710099.291 |  |
| 880500.0 | 11090332.56 | 9879927728.507 |  |
| 881000.0 | 11094626.565 | 9891151729.566 |  |
| 881500.0 | 11098919.774 | 9902382102.467 |  |
| 882000.0 | 11103212.166 | 9913618847.212 |  |
| 882500.0 | 11107503.725 | 9924861963.799 |  |
| 883000.0 | 11111794.491 | 9936111452.229 |  |
| 883500.0 | 11116084.456 | 9947367312.501 |  |
| 884000.0 | 11120373.617 | 9958629544.617 |  |
| 884500.0 | 11124661.947 | 9969898148.575 |  |
| 885000.0 | 11128949.478 | 9981173124.376 |  |
| 885500.0 | 11133236.218 | 9992454472.02 |  |
| 886000.0 | 11137522.153 | 10003742191.507 |  |
| 886500.0 | 11141807.249 | 10015036282.836 |  |
| 887000.0 | 11146091.552 | 10026336746.008 |  |
| 887500.0 | 11150375.062 | 10037643581.023 |  |
| 888000.0 | 11154657.781 | 10048956787.881 |  |
| 888500.0 | 11158939.664 | 10060276366.582 |  |
| 889000.0 | 11163220.748 | 10071602317.125 |  |
| 889500.0 | 11167501.075 | 10082934639.511 |  |
| 890000.0 | 11171780.558 | 10094273333.74 |  |
| 890500.0 | 11176059.219 | 10105618399.812 |  |
| 891000.0 | 11180337.115 | 10116969837.726 |  |
| 891500.0 | 11184614.222 | 10128327647.483 |  |
| 892000.0 | 11188890.496 | 10139691829.083 |  |
| 892500.0 | 11193166.003 | 10151062382.526 |  |
| 893000.0 | 11197440.708 | 10162439307.812 |  |
| 893500.0 | 11201714.603 | 10173822604.94 |  |
| 894000.0 | 11205987.714 | 10185212273.911 |  |
| 894500.0 | 11210260.016 | 10196608314.725 |  |
| 895000.0 | 11214531.516 | 10208010727.382 |  |
| 895500.0 | 11218802.223 | 10219419511.881 |  |
| 896000.0 | 11223072.152 | 10230834668.223 |  |
| 896500.0 | 11227341.293 | 10242256196.409 |  |
| 897000.0 | 11231609.614 | 10253684096.436 |  |
| 897500.0 | 11235877.141 | 10265118368.307 |  |
| 898000.0 | 11240143.905 | 10276559012.02 |  |
| 898500.0 | 11244409.858 | 10288006027.576 |  |
| 899000.0 | 11248675.037 | 10299459414.975 |  |
| 899500.0 | 11252939.402 | 10310919174.217 |  |
| 900000.0 | 11257202.972 | 10322385305.302 |  |
| 900500.0 | 11261465.77 | 10333857808.229 |  |
| 901000.0 | 11265727.795 | 10345336682.999 |  |
| 901500.0 | 11269989.021 | 10356821929.612 |  |
| 902000.0 | 11274249.456 | 10368313548.067 |  |
| 902500.0 | 11278509.082 | 10379811538.366 |  |
| 903000.0 | 11282767.942 | 10391315900.507 |  |
| 903500.0 | 11287026.026 | 10402826634.491 |  |
| 904000.0 | 11291283.302 | 10414343740.318 |  |
| 904500.0 | 11295539.823 | 10425867217.987 |  |
| 905000.0 | 11299795.536 | 10437397067.5 |  |
| 905500.0 | 11304050.475 | 10448933288.855 |  |
| 906000.0 | 11308304.65 | 10460475882.052 |  |
| 906500.0 | 11312558.018 | 10472024847.093 |  |
| 907000.0 | 11316810.597 | 10483580183.977 |  |
| 907500.0 | 11321062.409 | 10495141892.703 |  |
| 908000.0 | 11325313.451 | 10506709973.272 |  |
| 908500.0 | 11329563.696 | 10518284425.684 |  |
| 909000.0 | 11333813.177 | 10529865249.938 |  |
| 909500.0 | 11338061.874 | 10541452446.035 |  |
| 910000.0 | 11342309.77 | 10553046013.976 |  |
| 910500.0 | 11346556.912 | 10564645953.758 |  |
| 911000.0 | 11350803.262 | 10576252265.384 |  |
| 911500.0 | 11355048.873 | 10587864948.853 |  |
| 912000.0 | 11359293.656 | 10599484004.164 |  |
| 912500.0 | 11363537.703 | 10611109431.318 |  |
| 913000.0 | 11367780.962 | 10622741230.315 |  |
| 913500.0 | 11372023.442 | 10634379401.154 |  |
| 914000.0 | 11376265.159 | 10646023943.837 |  |
| 914500.0 | 11380506.102 | 10657674858.362 |  |
| 915000.0 | 11384746.263 | 10669332144.73 |  |
| 915500.0 | 11388985.639 | 10680995802.941 |  |
| 916000.0 | 11393224.258 | 10692665832.994 |  |
| 916500.0 | 11397462.127 | 10704342234.89 |  |
| 917000.0 | 11401699.192 | 10716025008.629 |  |
| 917500.0 | 11405935.526 | 10727714154.211 |  |
| 918000.0 | 11410171.054 | 10739409671.636 |  |
| 918500.0 | 11414405.825 | 10751111560.903 |  |
| 919000.0 | 11418639.832 | 10762819822.013 |  |
| 919500.0 | 11422873.073 | 10774534454.966 |  |
| 920000.0 | 11427105.549 | 10786255459.762 |  |
| 920500.0 | 11431337.262 | 10797982836.401 |  |
| 921000.0 | 11435568.193 | 10809716584.882 |  |
| 921500.0 | 11439798.352 | 10821456705.206 |  |
| 922000.0 | 11444027.785 | 10833203197.373 |  |
| 922500.0 | 11448256.421 | 10844956061.382 |  |
| 923000.0 | 11452484.314 | 10856715297.235 |  |
| 923500.0 | 11456711.43 | 10868480904.93 |  |
| 924000.0 | 11460937.769 | 10880252884.468 |  |
| 924500.0 | 11465163.366 | 10892031235.849 |  |
| 925000.0 | 11469388.197 | 10903815959.072 |  |
| 925500.0 | 11473612.275 | 10915607054.139 |  |
| 926000.0 | 11477835.583 | 10927404521.048 |  |
| 926500.0 | 11482058.141 | 10939208359.8 |  |
| 927000.0 | 11486279.94 | 10951018570.394 |  |
| 927500.0 | 11490500.976 | 10962835152.832 |  |
| 928000.0 | 11494721.247 | 10974658107.112 |  |
| 928500.0 | 11498940.758 | 10986487433.235 |  |
| 929000.0 | 11503159.514 | 10998323131.201 |  |
| 929500.0 | 11507377.525 | 11010165201.01 |  |
| 930000.0 | 11511594.805 | 11022013642.661 |  |
| 930500.0 | 11515811.278 | 11033868456.155 |  |
| 931000.0 | 11520027.028 | 11045729641.492 |  |
| 931500.0 | 11524241.986 | 11057597198.672 |  |
| 932000.0 | 11528456.242 | 11069471127.694 |  |
| 932500.0 | 11532669.735 | 11081351428.559 |  |
| 933000.0 | 11536882.438 | 11093238101.267 |  |
| 933500.0 | 11541094.422 | 11105131145.818 |  |
| 934000.0 | 11545305.635 | 11117030562.212 |  |
| 934500.0 | 11549516.124 | 11128936350.448 |  |
| 935000.0 | 11553725.845 | 11140848510.528 |  |
| 935500.0 | 11557934.789 | 11152767042.449 |  |
| 936000.0 | 11562143.012 | 11164691946.214 |  |
| 936500.0 | 11566350.483 | 11176623221.822 |  |
| 937000.0 | 11570557.201 | 11188560869.272 |  |
| 937500.0 | 11574763.205 | 11200504888.565 |  |
| 938000.0 | 11578968.406 | 11212455279.701 |  |
| 938500.0 | 11583172.913 | 11224412042.68 |  |
| 939000.0 | 11587376.615 | 11236375177.501 |  |
| 939500.0 | 11591579.625 | 11248344684.165 |  |
| 940000.0 | 11595781.871 | 11260320562.672 |  |
| 940500.0 | 11599983.38 | 11272302813.022 |  |
| 941000.0 | 11604184.116 | 11284291435.215 |  |
| 941500.0 | 11608384.147 | 11296286429.25 |  |
| 942000.0 | 11612583.411 | 11308287795.128 |  |
| 942500.0 | 11616781.95 | 11320295532.849 |  |
| 943000.0 | 11620979.711 | 11332309642.413 |  |
| 943500.0 | 11625176.773 | 11344330123.819 |  |
| 944000.0 | 11629373.06 | 11356356977.068 |  |
| 944500.0 | 11633568.624 | 11368390202.16 |  |
| 945000.0 | 11637763.461 | 11380429799.095 |  |
| 945500.0 | 11641957.533 | 11392475767.873 |  |
| 946000.0 | 11646150.874 | 11404528108.493 |  |
| 946500.0 | 11650343.488 | 11416586820.956 |  |
| 947000.0 | 11654535.348 | 11428651905.262 |  |
| 947500.0 | 11658726.466 | 11440723361.411 |  |
| 948000.0 | 11662916.888 | 11452801189.402 |  |
| 948500.0 | 11667106.533 | 11464885389.236 |  |
| 949000.0 | 11671295.455 | 11476975960.913 |  |
| 949500.0 | 11675483.646 | 11489072904.433 |  |
| 950000.0 | 11679671.1 | 11501176219.796 |  |
| 950500.0 | 11683857.815 | 11513285907.001 |  |
| 951000.0 | 11688043.793 | 11525401966.049 |  |
| 951500.0 | 11692229.04 | 11537524396.94 |  |
| 952000.0 | 11696413.562 | 11549653199.674 |  |
| 952500.0 | 11700597.34 | 11561788374.251 |  |
| 953000.0 | 11704780.387 | 11573929920.67 |  |
| 953500.0 | 11708962.724 | 11586077838.932 |  |
| 954000.0 | 11713144.303 | 11598232129.037 |  |
| 954500.0 | 11717325.186 | 11610392790.985 |  |
| 955000.0 | 11721505.3 | 11622559824.775 |  |
| 955500.0 | 11725684.71 | 11634733230.408 |  |
| 956000.0 | 11729863.384 | 11646913007.884 |  |
| 956500.0 | 11734041.329 | 11659099157.203 |  |
| 957000.0 | 11738218.553 | 11671291678.364 |  |
| 957500.0 | 11742395.033 | 11683490571.369 |  |
| 958000.0 | 11746570.82 | 11695695836.216 |  |
| 958500.0 | 11750745.829 | 11707907472.906 |  |
| 959000.0 | 11754920.151 | 11720125481.438 |  |
| 959500.0 | 11759093.743 | 11732349861.814 |  |
| 960000.0 | 11763266.599 | 11744580614.032 |  |
| 960500.0 | 11767438.753 | 11756817738.093 |  |
| 961000.0 | 11771610.17 | 11769061233.997 |  |
| 961500.0 | 11775780.855 | 11781311101.743 |  |
| 962000.0 | 11779950.816 | 11793567341.333 |  |
| 962500.0 | 11784120.065 | 11805829952.765 |  |
| 963000.0 | 11788288.614 | 11818098936.04 |  |
| 963500.0 | 11792456.414 | 11830374291.157 |  |
| 964000.0 | 11796623.485 | 11842656018.118 |  |
| 964500.0 | 11800789.85 | 11854944116.921 |  |
| 965000.0 | 11804955.505 | 11867238587.567 |  |
| 965500.0 | 11809120.443 | 11879539430.056 |  |
| 966000.0 | 11813284.63 | 11891846644.388 |  |
| 966500.0 | 11817448.138 | 11904160230.562 |  |
| 967000.0 | 11821610.904 | 11916480188.579 |  |
| 967500.0 | 11825772.971 | 11928806518.439 |  |
| 968000.0 | 11829934.317 | 11941139220.142 |  |
| 968500.0 | 11834094.921 | 11953478293.687 |  |
| 969000.0 | 11838254.84 | 11965823739.076 |  |
| 969500.0 | 11842414.022 | 11978175556.307 |  |
| 970000.0 | 11846572.495 | 11990533745.381 |  |
| 970500.0 | 11850730.252 | 12002898306.297 |  |
| 971000.0 | 11854887.324 | 12015269239.057 |  |
| 971500.0 | 11859043.64 | 12027646543.659 |  |
| 972000.0 | 11863199.274 | 12040030220.104 |  |
| 972500.0 | 11867354.197 | 12052420268.392 |  |
| 973000.0 | 11871508.382 | 12064816688.522 |  |
| 973500.0 | 11875661.877 | 12077219480.495 |  |
| 974000.0 | 11879814.626 | 12089628644.312 |  |
| 974500.0 | 11883966.721 | 12102044179.97 |  |
| 975000.0 | 11888118.075 | 12114466087.472 |  |
| 975500.0 | 11892268.714 | 12126894366.816 |  |
| 976000.0 | 11896418.666 | 12139329018.004 |  |
| 976500.0 | 11900567.891 | 12151770041.034 |  |
| 977000.0 | 11904716.424 | 12164217435.906 |  |
| 977500.0 | 11908864.229 | 12176671202.622 |  |
| 978000.0 | 11913011.35 | 12189131341.18 |  |
| 978500.0 | 11917157.757 | 12201597851.581 |  |
| 979000.0 | 11921303.462 | 12214070733.825 |  |
| 979500.0 | 11925448.443 | 12226549987.912 |  |
| 980000.0 | 11929592.718 | 12239035613.841 |  |
| 980500.0 | 11933736.307 | 12251527611.614 |  |
| 981000.0 | 11937879.199 | 12264025981.229 |  |
| 981500.0 | 11942021.345 | 12276530722.687 |  |
| 982000.0 | 11946162.852 | 12289041835.987 |  |
| 982500.0 | 11950303.604 | 12301559321.131 |  |
| 983000.0 | 11954443.674 | 12314083178.117 |  |
| 983500.0 | 11958583.03 | 12326613406.946 |  |
| 984000.0 | 11962721.714 | 12339150007.617 |  |
| 984500.0 | 11966859.661 | 12351692980.132 |  |
| 985000.0 | 11970996.919 | 12364242324.489 |  |
| 985500.0 | 11975133.506 | 12376798040.689 |  |
| 986000.0 | 11979269.363 | 12389360128.732 |  |
| 986500.0 | 11983404.55 | 12401928588.618 |  |
| 987000.0 | 11987539.017 | 12414503420.346 |  |
| 987500.0 | 11991672.791 | 12427084623.917 |  |
| 988000.0 | 11995805.828 | 12439672199.331 |  |
| 988500.0 | 11999938.199 | 12452266146.588 |  |
| 989000.0 | 12004069.904 | 12464866465.688 |  |
| 989500.0 | 12008200.871 | 12477473156.63 |  |
| 990000.0 | 12012331.179 | 12490086219.415 |  |
| 990500.0 | 12016460.761 | 12502705654.043 |  |
| 991000.0 | 12020589.668 | 12515331460.513 |  |
| 991500.0 | 12024717.876 | 12527963638.827 |  |
| 992000.0 | 12028845.363 | 12540602188.983 |  |
| 992500.0 | 12032972.19 | 12553247110.982 |  |
| 993000.0 | 12037098.342 | 12565898404.824 |  |
| 993500.0 | 12041223.769 | 12578556070.508 |  |
| 994000.0 | 12045348.5 | 12591220108.036 |  |
| 994500.0 | 12049472.57 | 12603890517.406 |  |
| 995000.0 | 12053595.937 | 12616567298.619 |  |
| 995500.0 | 12057718.563 | 12629250451.674 |  |
| 996000.0 | 12061840.567 | 12641939976.573 |  |
| 996500.0 | 12065961.84 | 12654635873.314 |  |
| 997000.0 | 12070082.47 | 12667338141.898 |  |
| 997500.0 | 12074202.351 | 12680046782.325 |  |
| 998000.0 | 12078321.579 | 12692761794.595 |  |
| 998500.0 | 12082440.131 | 12705483178.707 |  |
| 999000.0 | 12086557.992 | 12718210934.662 |  |
| 999500.0 | 12090675.146 | 12730945062.46 |  |
| 1000000.0 | 12094791.621 | 12743685562.101 |  |